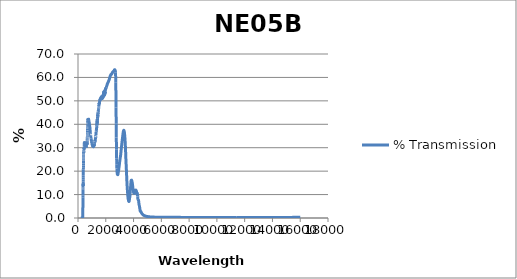
| Category | % Transmission |
|---|---|
| 200.0 | 0.035 |
| 201.0 | 0.035 |
| 202.0 | 0.035 |
| 203.0 | 0.035 |
| 204.0 | 0.034 |
| 205.0 | 0.034 |
| 206.0 | 0.033 |
| 207.0 | 0.033 |
| 208.0 | 0.033 |
| 209.0 | 0.032 |
| 210.0 | 0.032 |
| 211.0 | 0.032 |
| 212.0 | 0.032 |
| 213.0 | 0.031 |
| 214.0 | 0.031 |
| 215.0 | 0.031 |
| 216.0 | 0.03 |
| 217.0 | 0.03 |
| 218.0 | 0.03 |
| 219.0 | 0.03 |
| 220.0 | 0.03 |
| 221.0 | 0.029 |
| 222.0 | 0.029 |
| 223.0 | 0.029 |
| 224.0 | 0.029 |
| 225.0 | 0.028 |
| 226.0 | 0.028 |
| 227.0 | 0.028 |
| 228.0 | 0.028 |
| 229.0 | 0.027 |
| 230.0 | 0.027 |
| 231.0 | 0.027 |
| 232.0 | 0.027 |
| 233.0 | 0.027 |
| 234.0 | 0.027 |
| 235.0 | 0.027 |
| 236.0 | 0.026 |
| 237.0 | 0.026 |
| 238.0 | 0.026 |
| 239.0 | 0.026 |
| 240.0 | 0.026 |
| 241.0 | 0.026 |
| 242.0 | 0.026 |
| 243.0 | 0.025 |
| 244.0 | 0.025 |
| 245.0 | 0.025 |
| 246.0 | 0.025 |
| 247.0 | 0.025 |
| 248.0 | 0.025 |
| 249.0 | 0.025 |
| 250.0 | 0.024 |
| 251.0 | 0.024 |
| 252.0 | 0.024 |
| 253.0 | 0.024 |
| 254.0 | 0.024 |
| 255.0 | 0.024 |
| 256.0 | 0.024 |
| 257.0 | 0.024 |
| 258.0 | 0.023 |
| 259.0 | 0.023 |
| 260.0 | 0.023 |
| 261.0 | 0.023 |
| 262.0 | 0.023 |
| 263.0 | 0.023 |
| 264.0 | 0.023 |
| 265.0 | 0.023 |
| 266.0 | 0.023 |
| 267.0 | 0.023 |
| 268.0 | 0.022 |
| 269.0 | 0.022 |
| 270.0 | 0.022 |
| 271.0 | 0.022 |
| 272.0 | 0.022 |
| 273.0 | 0.022 |
| 274.0 | 0.022 |
| 275.0 | 0.022 |
| 276.0 | 0.022 |
| 277.0 | 0.021 |
| 278.0 | 0.021 |
| 279.0 | 0.021 |
| 280.0 | 0.021 |
| 281.0 | 0.021 |
| 282.0 | 0.021 |
| 283.0 | 0.021 |
| 284.0 | 0.021 |
| 285.0 | 0.021 |
| 286.0 | 0.021 |
| 287.0 | 0.021 |
| 288.0 | 0.02 |
| 289.0 | 0.02 |
| 290.0 | 0.02 |
| 291.0 | 0.02 |
| 292.0 | 0.02 |
| 293.0 | 0.02 |
| 294.0 | 0.02 |
| 295.0 | 0.02 |
| 296.0 | 0.02 |
| 297.0 | 0.02 |
| 298.0 | 0.02 |
| 299.0 | 0.02 |
| 300.0 | 0.02 |
| 301.0 | 0.02 |
| 302.0 | 0.02 |
| 303.0 | 0.02 |
| 304.0 | 0.019 |
| 305.0 | 0.019 |
| 306.0 | 0.019 |
| 307.0 | 0.019 |
| 308.0 | 0.019 |
| 309.0 | 0.019 |
| 310.0 | 0.019 |
| 311.0 | 0.019 |
| 312.0 | 0.019 |
| 313.0 | 0.019 |
| 314.0 | 0.019 |
| 315.0 | 0.019 |
| 316.0 | 0.019 |
| 317.0 | 0.019 |
| 318.0 | 0.019 |
| 319.0 | 0.016 |
| 320.0 | 0.016 |
| 321.0 | 0.016 |
| 322.0 | 0.017 |
| 323.0 | 0.017 |
| 324.0 | 0.017 |
| 325.0 | 0.018 |
| 326.0 | 0.02 |
| 327.0 | 0.023 |
| 328.0 | 0.028 |
| 329.0 | 0.035 |
| 330.0 | 0.046 |
| 331.0 | 0.062 |
| 332.0 | 0.084 |
| 333.0 | 0.113 |
| 334.0 | 0.153 |
| 335.0 | 0.202 |
| 336.0 | 0.266 |
| 337.0 | 0.35 |
| 338.0 | 0.453 |
| 339.0 | 0.581 |
| 340.0 | 0.731 |
| 341.0 | 0.902 |
| 342.0 | 1.106 |
| 343.0 | 1.327 |
| 344.0 | 1.585 |
| 345.0 | 1.873 |
| 346.0 | 2.196 |
| 347.0 | 2.533 |
| 348.0 | 2.92 |
| 349.0 | 3.341 |
| 350.0 | 3.802 |
| 351.0 | 4.289 |
| 352.0 | 4.795 |
| 353.0 | 5.276 |
| 354.0 | 5.813 |
| 355.0 | 6.373 |
| 356.0 | 6.977 |
| 357.0 | 7.609 |
| 358.0 | 8.24 |
| 359.0 | 8.819 |
| 360.0 | 9.467 |
| 361.0 | 10.086 |
| 362.0 | 10.761 |
| 363.0 | 11.398 |
| 364.0 | 12.011 |
| 365.0 | 12.537 |
| 366.0 | 13.116 |
| 367.0 | 13.609 |
| 368.0 | 14.069 |
| 369.0 | 14.492 |
| 370.0 | 14.73 |
| 371.0 | 14.758 |
| 372.0 | 14.711 |
| 373.0 | 14.512 |
| 374.0 | 14.277 |
| 375.0 | 14.029 |
| 376.0 | 13.837 |
| 377.0 | 13.69 |
| 378.0 | 13.903 |
| 379.0 | 14.286 |
| 380.0 | 14.854 |
| 381.0 | 15.499 |
| 382.0 | 16.312 |
| 383.0 | 17.19 |
| 384.0 | 18.195 |
| 385.0 | 19.168 |
| 386.0 | 20.051 |
| 387.0 | 20.815 |
| 388.0 | 21.686 |
| 389.0 | 22.414 |
| 390.0 | 23.208 |
| 391.0 | 23.932 |
| 392.0 | 24.541 |
| 393.0 | 24.892 |
| 394.0 | 25.418 |
| 395.0 | 25.853 |
| 396.0 | 26.366 |
| 397.0 | 26.783 |
| 398.0 | 27.117 |
| 399.0 | 27.202 |
| 400.0 | 27.426 |
| 401.0 | 27.615 |
| 402.0 | 27.845 |
| 403.0 | 28.004 |
| 404.0 | 28.106 |
| 405.0 | 27.989 |
| 406.0 | 28.012 |
| 407.0 | 28.044 |
| 408.0 | 28.161 |
| 409.0 | 28.178 |
| 410.0 | 28.118 |
| 411.0 | 27.95 |
| 412.0 | 28.001 |
| 413.0 | 28.046 |
| 414.0 | 28.137 |
| 415.0 | 28.281 |
| 416.0 | 28.318 |
| 417.0 | 28.248 |
| 418.0 | 28.348 |
| 419.0 | 28.508 |
| 420.0 | 28.703 |
| 421.0 | 28.918 |
| 422.0 | 28.997 |
| 423.0 | 28.987 |
| 424.0 | 29.126 |
| 425.0 | 29.282 |
| 426.0 | 29.455 |
| 427.0 | 29.655 |
| 428.0 | 29.713 |
| 429.0 | 29.66 |
| 430.0 | 29.684 |
| 431.0 | 29.762 |
| 432.0 | 29.844 |
| 433.0 | 29.91 |
| 434.0 | 29.847 |
| 435.0 | 29.711 |
| 436.0 | 29.644 |
| 437.0 | 29.638 |
| 438.0 | 29.68 |
| 439.0 | 29.753 |
| 440.0 | 29.742 |
| 441.0 | 29.648 |
| 442.0 | 29.676 |
| 443.0 | 29.807 |
| 444.0 | 29.972 |
| 445.0 | 30.196 |
| 446.0 | 30.318 |
| 447.0 | 30.366 |
| 448.0 | 30.548 |
| 449.0 | 30.73 |
| 450.0 | 31.002 |
| 451.0 | 31.359 |
| 452.0 | 31.472 |
| 453.0 | 31.463 |
| 454.0 | 31.622 |
| 455.0 | 31.76 |
| 456.0 | 31.973 |
| 457.0 | 32.228 |
| 458.0 | 32.287 |
| 459.0 | 32.22 |
| 460.0 | 32.25 |
| 461.0 | 32.319 |
| 462.0 | 32.437 |
| 463.0 | 32.556 |
| 464.0 | 32.519 |
| 465.0 | 32.375 |
| 466.0 | 32.37 |
| 467.0 | 32.347 |
| 468.0 | 32.4 |
| 469.0 | 32.46 |
| 470.0 | 32.348 |
| 471.0 | 32.16 |
| 472.0 | 32.115 |
| 473.0 | 32.09 |
| 474.0 | 32.132 |
| 475.0 | 32.171 |
| 476.0 | 32.017 |
| 477.0 | 31.8 |
| 478.0 | 31.728 |
| 479.0 | 31.673 |
| 480.0 | 31.71 |
| 481.0 | 31.753 |
| 482.0 | 31.618 |
| 483.0 | 31.418 |
| 484.0 | 31.339 |
| 485.0 | 31.266 |
| 486.0 | 31.307 |
| 487.0 | 31.357 |
| 488.0 | 31.219 |
| 489.0 | 31.045 |
| 490.0 | 31.004 |
| 491.0 | 30.967 |
| 492.0 | 31.006 |
| 493.0 | 31.064 |
| 494.0 | 30.948 |
| 495.0 | 30.81 |
| 496.0 | 30.776 |
| 497.0 | 30.767 |
| 498.0 | 30.829 |
| 499.0 | 30.844 |
| 500.0 | 30.731 |
| 501.0 | 30.614 |
| 502.0 | 30.609 |
| 503.0 | 30.639 |
| 504.0 | 30.704 |
| 505.0 | 30.775 |
| 506.0 | 30.684 |
| 507.0 | 30.585 |
| 508.0 | 30.576 |
| 509.0 | 30.591 |
| 510.0 | 30.686 |
| 511.0 | 30.771 |
| 512.0 | 30.699 |
| 513.0 | 30.63 |
| 514.0 | 30.668 |
| 515.0 | 30.715 |
| 516.0 | 30.83 |
| 517.0 | 30.96 |
| 518.0 | 30.922 |
| 519.0 | 30.864 |
| 520.0 | 30.894 |
| 521.0 | 30.976 |
| 522.0 | 31.122 |
| 523.0 | 31.241 |
| 524.0 | 31.213 |
| 525.0 | 31.191 |
| 526.0 | 31.229 |
| 527.0 | 31.312 |
| 528.0 | 31.501 |
| 529.0 | 31.633 |
| 530.0 | 31.578 |
| 531.0 | 31.562 |
| 532.0 | 31.634 |
| 533.0 | 31.727 |
| 534.0 | 31.901 |
| 535.0 | 32.012 |
| 536.0 | 31.978 |
| 537.0 | 31.973 |
| 538.0 | 32.049 |
| 539.0 | 32.119 |
| 540.0 | 32.285 |
| 541.0 | 32.362 |
| 542.0 | 32.261 |
| 543.0 | 32.226 |
| 544.0 | 32.263 |
| 545.0 | 32.396 |
| 546.0 | 32.484 |
| 547.0 | 32.547 |
| 548.0 | 32.426 |
| 549.0 | 32.338 |
| 550.0 | 32.343 |
| 551.0 | 32.413 |
| 552.0 | 32.454 |
| 553.0 | 32.37 |
| 554.0 | 32.308 |
| 555.0 | 32.227 |
| 556.0 | 32.153 |
| 557.0 | 32.207 |
| 558.0 | 32.269 |
| 559.0 | 32.292 |
| 560.0 | 32.098 |
| 561.0 | 32.083 |
| 562.0 | 31.977 |
| 563.0 | 31.839 |
| 564.0 | 31.775 |
| 565.0 | 31.783 |
| 566.0 | 31.823 |
| 567.0 | 31.672 |
| 568.0 | 31.511 |
| 569.0 | 31.384 |
| 570.0 | 31.309 |
| 571.0 | 31.323 |
| 572.0 | 31.35 |
| 573.0 | 31.194 |
| 574.0 | 31.062 |
| 575.0 | 30.953 |
| 576.0 | 30.854 |
| 577.0 | 30.848 |
| 578.0 | 30.88 |
| 579.0 | 30.729 |
| 580.0 | 30.546 |
| 581.0 | 30.462 |
| 582.0 | 30.396 |
| 583.0 | 30.448 |
| 584.0 | 30.507 |
| 585.0 | 30.365 |
| 586.0 | 30.271 |
| 587.0 | 30.218 |
| 588.0 | 30.151 |
| 589.0 | 30.234 |
| 590.0 | 30.306 |
| 591.0 | 30.23 |
| 592.0 | 30.173 |
| 593.0 | 30.183 |
| 594.0 | 30.143 |
| 595.0 | 30.293 |
| 596.0 | 30.372 |
| 597.0 | 30.318 |
| 598.0 | 30.278 |
| 599.0 | 30.369 |
| 600.0 | 30.395 |
| 601.0 | 30.495 |
| 602.0 | 30.595 |
| 603.0 | 30.591 |
| 604.0 | 30.533 |
| 605.0 | 30.631 |
| 606.0 | 30.655 |
| 607.0 | 30.778 |
| 608.0 | 30.903 |
| 609.0 | 30.929 |
| 610.0 | 30.87 |
| 611.0 | 30.96 |
| 612.0 | 30.944 |
| 613.0 | 31.092 |
| 614.0 | 31.225 |
| 615.0 | 31.175 |
| 616.0 | 31.167 |
| 617.0 | 31.231 |
| 618.0 | 31.282 |
| 619.0 | 31.405 |
| 620.0 | 31.52 |
| 621.0 | 31.422 |
| 622.0 | 31.437 |
| 623.0 | 31.506 |
| 624.0 | 31.42 |
| 625.0 | 31.605 |
| 626.0 | 31.755 |
| 627.0 | 31.553 |
| 628.0 | 31.549 |
| 629.0 | 31.606 |
| 630.0 | 31.58 |
| 631.0 | 31.678 |
| 632.0 | 31.754 |
| 633.0 | 31.58 |
| 634.0 | 31.561 |
| 635.0 | 31.59 |
| 636.0 | 31.558 |
| 637.0 | 31.621 |
| 638.0 | 31.754 |
| 639.0 | 31.561 |
| 640.0 | 31.52 |
| 641.0 | 31.523 |
| 642.0 | 31.546 |
| 643.0 | 31.62 |
| 644.0 | 31.693 |
| 645.0 | 31.542 |
| 646.0 | 31.572 |
| 647.0 | 31.609 |
| 648.0 | 31.643 |
| 649.0 | 31.718 |
| 650.0 | 31.841 |
| 651.0 | 31.728 |
| 652.0 | 31.753 |
| 653.0 | 31.775 |
| 654.0 | 31.848 |
| 655.0 | 32.056 |
| 656.0 | 32.217 |
| 657.0 | 32.027 |
| 658.0 | 32.067 |
| 659.0 | 32.189 |
| 660.0 | 32.264 |
| 661.0 | 32.502 |
| 662.0 | 32.645 |
| 663.0 | 32.558 |
| 664.0 | 32.659 |
| 665.0 | 32.892 |
| 666.0 | 33.008 |
| 667.0 | 33.223 |
| 668.0 | 33.558 |
| 669.0 | 33.496 |
| 670.0 | 33.61 |
| 671.0 | 33.83 |
| 672.0 | 34.106 |
| 673.0 | 34.367 |
| 674.0 | 34.514 |
| 675.0 | 34.582 |
| 676.0 | 34.734 |
| 677.0 | 35.054 |
| 678.0 | 35.229 |
| 679.0 | 35.678 |
| 680.0 | 35.923 |
| 681.0 | 35.961 |
| 682.0 | 36.218 |
| 683.0 | 36.541 |
| 684.0 | 36.701 |
| 685.0 | 37.127 |
| 686.0 | 37.392 |
| 687.0 | 37.416 |
| 688.0 | 37.585 |
| 689.0 | 38.057 |
| 690.0 | 38.226 |
| 691.0 | 38.4 |
| 692.0 | 38.582 |
| 693.0 | 38.904 |
| 694.0 | 38.917 |
| 695.0 | 39.269 |
| 696.0 | 39.225 |
| 697.0 | 39.642 |
| 698.0 | 39.916 |
| 699.0 | 39.852 |
| 700.0 | 39.898 |
| 701.0 | 40.243 |
| 702.0 | 40.287 |
| 703.0 | 40.599 |
| 704.0 | 40.752 |
| 705.0 | 40.749 |
| 706.0 | 40.767 |
| 707.0 | 40.952 |
| 708.0 | 40.865 |
| 709.0 | 41.267 |
| 710.0 | 41.43 |
| 711.0 | 41.217 |
| 712.0 | 41.328 |
| 713.0 | 41.531 |
| 714.0 | 41.475 |
| 715.0 | 41.781 |
| 716.0 | 41.789 |
| 717.0 | 41.698 |
| 718.0 | 41.762 |
| 719.0 | 41.875 |
| 720.0 | 41.82 |
| 721.0 | 42.055 |
| 722.0 | 42.062 |
| 723.0 | 41.972 |
| 724.0 | 41.995 |
| 725.0 | 42.08 |
| 726.0 | 42.017 |
| 727.0 | 42.175 |
| 728.0 | 42.222 |
| 729.0 | 42.083 |
| 730.0 | 42.164 |
| 731.0 | 42.21 |
| 732.0 | 42.1 |
| 733.0 | 42.237 |
| 734.0 | 42.351 |
| 735.0 | 42.118 |
| 736.0 | 42.145 |
| 737.0 | 42.185 |
| 738.0 | 42.231 |
| 739.0 | 42.324 |
| 740.0 | 42.398 |
| 741.0 | 42.109 |
| 742.0 | 42.165 |
| 743.0 | 42.168 |
| 744.0 | 42.173 |
| 745.0 | 42.189 |
| 746.0 | 42.375 |
| 747.0 | 42.108 |
| 748.0 | 42.088 |
| 749.0 | 42.051 |
| 750.0 | 42.179 |
| 751.0 | 42.176 |
| 752.0 | 42.18 |
| 753.0 | 42.183 |
| 754.0 | 42.175 |
| 755.0 | 42.169 |
| 756.0 | 42.159 |
| 757.0 | 42.148 |
| 758.0 | 42.144 |
| 759.0 | 42.139 |
| 760.0 | 42.118 |
| 761.0 | 42.106 |
| 762.0 | 42.092 |
| 763.0 | 42.076 |
| 764.0 | 42.061 |
| 765.0 | 42.044 |
| 766.0 | 42.015 |
| 767.0 | 41.993 |
| 768.0 | 41.969 |
| 769.0 | 41.944 |
| 770.0 | 41.922 |
| 771.0 | 41.903 |
| 772.0 | 41.867 |
| 773.0 | 41.842 |
| 774.0 | 41.817 |
| 775.0 | 41.787 |
| 776.0 | 41.767 |
| 777.0 | 41.741 |
| 778.0 | 41.702 |
| 779.0 | 41.671 |
| 780.0 | 41.641 |
| 781.0 | 41.61 |
| 782.0 | 41.584 |
| 783.0 | 41.554 |
| 784.0 | 41.511 |
| 785.0 | 41.475 |
| 786.0 | 41.44 |
| 787.0 | 41.406 |
| 788.0 | 41.377 |
| 789.0 | 41.344 |
| 790.0 | 41.3 |
| 791.0 | 41.262 |
| 792.0 | 41.231 |
| 793.0 | 41.197 |
| 794.0 | 41.17 |
| 795.0 | 41.136 |
| 796.0 | 41.092 |
| 797.0 | 41.052 |
| 798.0 | 41.011 |
| 799.0 | 40.974 |
| 800.0 | 40.947 |
| 801.0 | 40.909 |
| 802.0 | 40.867 |
| 803.0 | 40.83 |
| 804.0 | 40.79 |
| 805.0 | 40.749 |
| 806.0 | 40.716 |
| 807.0 | 40.676 |
| 808.0 | 40.633 |
| 809.0 | 40.595 |
| 810.0 | 40.564 |
| 811.0 | 40.522 |
| 812.0 | 40.478 |
| 813.0 | 40.428 |
| 814.0 | 40.38 |
| 815.0 | 40.346 |
| 816.0 | 40.314 |
| 817.0 | 40.269 |
| 818.0 | 40.223 |
| 819.0 | 40.173 |
| 820.0 | 40.125 |
| 821.0 | 40.087 |
| 822.0 | 40.054 |
| 823.0 | 40.011 |
| 824.0 | 39.962 |
| 825.0 | 39.91 |
| 826.0 | 39.863 |
| 827.0 | 39.822 |
| 828.0 | 39.782 |
| 829.0 | 39.737 |
| 830.0 | 39.696 |
| 831.0 | 39.648 |
| 832.0 | 39.602 |
| 833.0 | 39.566 |
| 834.0 | 39.53 |
| 835.0 | 39.481 |
| 836.0 | 39.44 |
| 837.0 | 39.403 |
| 838.0 | 39.368 |
| 839.0 | 39.332 |
| 840.0 | 39.29 |
| 841.0 | 39.237 |
| 842.0 | 39.196 |
| 843.0 | 39.159 |
| 844.0 | 39.116 |
| 845.0 | 39.075 |
| 846.0 | 39.039 |
| 847.0 | 38.997 |
| 848.0 | 38.957 |
| 849.0 | 38.917 |
| 850.0 | 38.876 |
| 851.0 | 38.835 |
| 852.0 | 38.791 |
| 853.0 | 38.746 |
| 854.0 | 38.703 |
| 855.0 | 38.657 |
| 856.0 | 38.618 |
| 857.0 | 38.576 |
| 858.0 | 38.528 |
| 859.0 | 38.481 |
| 860.0 | 38.439 |
| 861.0 | 38.388 |
| 862.0 | 38.324 |
| 863.0 | 38.272 |
| 864.0 | 38.215 |
| 865.0 | 38.147 |
| 866.0 | 38.053 |
| 867.0 | 37.932 |
| 868.0 | 37.827 |
| 869.0 | 37.759 |
| 870.0 | 37.716 |
| 871.0 | 37.665 |
| 872.0 | 37.566 |
| 873.0 | 37.434 |
| 874.0 | 37.308 |
| 875.0 | 37.217 |
| 876.0 | 37.176 |
| 877.0 | 37.139 |
| 878.0 | 37.078 |
| 879.0 | 37.009 |
| 880.0 | 36.936 |
| 881.0 | 36.808 |
| 882.0 | 36.666 |
| 883.0 | 36.567 |
| 884.0 | 36.482 |
| 885.0 | 36.384 |
| 886.0 | 36.308 |
| 887.0 | 36.263 |
| 888.0 | 36.207 |
| 889.0 | 36.132 |
| 890.0 | 36.058 |
| 891.0 | 36.02 |
| 892.0 | 35.996 |
| 893.0 | 35.959 |
| 894.0 | 35.909 |
| 895.0 | 35.845 |
| 896.0 | 35.775 |
| 897.0 | 35.757 |
| 898.0 | 35.776 |
| 899.0 | 35.778 |
| 900.0 | 35.724 |
| 901.0 | 35.62 |
| 902.0 | 35.53 |
| 903.0 | 35.471 |
| 904.0 | 35.399 |
| 905.0 | 35.324 |
| 906.0 | 35.315 |
| 907.0 | 35.316 |
| 908.0 | 35.245 |
| 909.0 | 35.18 |
| 910.0 | 35.196 |
| 911.0 | 35.22 |
| 912.0 | 35.17 |
| 913.0 | 35.058 |
| 914.0 | 34.971 |
| 915.0 | 34.94 |
| 916.0 | 34.936 |
| 917.0 | 34.928 |
| 918.0 | 34.909 |
| 919.0 | 34.869 |
| 920.0 | 34.77 |
| 921.0 | 34.662 |
| 922.0 | 34.582 |
| 923.0 | 34.533 |
| 924.0 | 34.507 |
| 925.0 | 34.491 |
| 926.0 | 34.442 |
| 927.0 | 34.381 |
| 928.0 | 34.353 |
| 929.0 | 34.338 |
| 930.0 | 34.301 |
| 931.0 | 34.266 |
| 932.0 | 34.263 |
| 933.0 | 34.269 |
| 934.0 | 34.235 |
| 935.0 | 34.145 |
| 936.0 | 34.011 |
| 937.0 | 33.941 |
| 938.0 | 33.976 |
| 939.0 | 33.986 |
| 940.0 | 33.898 |
| 941.0 | 33.794 |
| 942.0 | 33.753 |
| 943.0 | 33.723 |
| 944.0 | 33.653 |
| 945.0 | 33.627 |
| 946.0 | 33.623 |
| 947.0 | 33.623 |
| 948.0 | 33.622 |
| 949.0 | 33.59 |
| 950.0 | 33.518 |
| 951.0 | 33.455 |
| 952.0 | 33.413 |
| 953.0 | 33.373 |
| 954.0 | 33.341 |
| 955.0 | 33.312 |
| 956.0 | 33.256 |
| 957.0 | 33.168 |
| 958.0 | 33.132 |
| 959.0 | 33.119 |
| 960.0 | 33.087 |
| 961.0 | 33.085 |
| 962.0 | 33.06 |
| 963.0 | 33.006 |
| 964.0 | 32.959 |
| 965.0 | 32.962 |
| 966.0 | 32.983 |
| 967.0 | 32.94 |
| 968.0 | 32.873 |
| 969.0 | 32.872 |
| 970.0 | 32.859 |
| 971.0 | 32.816 |
| 972.0 | 32.732 |
| 973.0 | 32.655 |
| 974.0 | 32.589 |
| 975.0 | 32.607 |
| 976.0 | 32.645 |
| 977.0 | 32.637 |
| 978.0 | 32.561 |
| 979.0 | 32.479 |
| 980.0 | 32.456 |
| 981.0 | 32.439 |
| 982.0 | 32.448 |
| 983.0 | 32.413 |
| 984.0 | 32.37 |
| 985.0 | 32.34 |
| 986.0 | 32.32 |
| 987.0 | 32.305 |
| 988.0 | 32.248 |
| 989.0 | 32.208 |
| 990.0 | 32.2 |
| 991.0 | 32.145 |
| 992.0 | 32.102 |
| 993.0 | 32.124 |
| 994.0 | 32.12 |
| 995.0 | 32.088 |
| 996.0 | 32.049 |
| 997.0 | 32.019 |
| 998.0 | 32.011 |
| 999.0 | 32.014 |
| 1000.0 | 31.952 |
| 1001.0 | 31.877 |
| 1002.0 | 31.857 |
| 1003.0 | 31.87 |
| 1004.0 | 31.884 |
| 1005.0 | 31.858 |
| 1006.0 | 31.812 |
| 1007.0 | 31.786 |
| 1008.0 | 31.781 |
| 1009.0 | 31.77 |
| 1010.0 | 31.737 |
| 1011.0 | 31.689 |
| 1012.0 | 31.681 |
| 1013.0 | 31.709 |
| 1014.0 | 31.714 |
| 1015.0 | 31.679 |
| 1016.0 | 31.64 |
| 1017.0 | 31.619 |
| 1018.0 | 31.569 |
| 1019.0 | 31.518 |
| 1020.0 | 31.5 |
| 1021.0 | 31.506 |
| 1022.0 | 31.505 |
| 1023.0 | 31.427 |
| 1024.0 | 31.403 |
| 1025.0 | 31.396 |
| 1026.0 | 31.384 |
| 1027.0 | 31.329 |
| 1028.0 | 31.273 |
| 1029.0 | 31.278 |
| 1030.0 | 31.305 |
| 1031.0 | 31.335 |
| 1032.0 | 31.283 |
| 1033.0 | 31.213 |
| 1034.0 | 31.162 |
| 1035.0 | 31.181 |
| 1036.0 | 31.209 |
| 1037.0 | 31.195 |
| 1038.0 | 31.145 |
| 1039.0 | 31.088 |
| 1040.0 | 31.02 |
| 1041.0 | 30.992 |
| 1042.0 | 31.011 |
| 1043.0 | 31.009 |
| 1044.0 | 31.004 |
| 1045.0 | 30.995 |
| 1046.0 | 30.97 |
| 1047.0 | 30.938 |
| 1048.0 | 30.987 |
| 1049.0 | 30.981 |
| 1050.0 | 30.978 |
| 1051.0 | 30.99 |
| 1052.0 | 30.993 |
| 1053.0 | 30.98 |
| 1054.0 | 30.891 |
| 1055.0 | 30.786 |
| 1056.0 | 30.767 |
| 1057.0 | 30.787 |
| 1058.0 | 30.805 |
| 1059.0 | 30.819 |
| 1060.0 | 30.77 |
| 1061.0 | 30.715 |
| 1062.0 | 30.698 |
| 1063.0 | 30.704 |
| 1064.0 | 30.73 |
| 1065.0 | 30.773 |
| 1066.0 | 30.786 |
| 1067.0 | 30.747 |
| 1068.0 | 30.705 |
| 1069.0 | 30.67 |
| 1070.0 | 30.614 |
| 1071.0 | 30.607 |
| 1072.0 | 30.677 |
| 1073.0 | 30.676 |
| 1074.0 | 30.643 |
| 1075.0 | 30.618 |
| 1076.0 | 30.589 |
| 1077.0 | 30.563 |
| 1078.0 | 30.562 |
| 1079.0 | 30.658 |
| 1080.0 | 30.77 |
| 1081.0 | 30.764 |
| 1082.0 | 30.726 |
| 1083.0 | 30.703 |
| 1084.0 | 30.661 |
| 1085.0 | 30.644 |
| 1086.0 | 30.684 |
| 1087.0 | 30.697 |
| 1088.0 | 30.702 |
| 1089.0 | 30.713 |
| 1090.0 | 30.697 |
| 1091.0 | 30.673 |
| 1092.0 | 30.638 |
| 1093.0 | 30.613 |
| 1094.0 | 30.652 |
| 1095.0 | 30.72 |
| 1096.0 | 30.755 |
| 1097.0 | 30.726 |
| 1098.0 | 30.672 |
| 1099.0 | 30.634 |
| 1100.0 | 30.588 |
| 1101.0 | 30.575 |
| 1102.0 | 30.628 |
| 1103.0 | 30.671 |
| 1104.0 | 30.658 |
| 1105.0 | 30.618 |
| 1106.0 | 30.611 |
| 1107.0 | 30.611 |
| 1108.0 | 30.599 |
| 1109.0 | 30.596 |
| 1110.0 | 30.562 |
| 1111.0 | 30.484 |
| 1112.0 | 30.47 |
| 1113.0 | 30.46 |
| 1114.0 | 30.446 |
| 1115.0 | 30.472 |
| 1116.0 | 30.521 |
| 1117.0 | 30.566 |
| 1118.0 | 30.608 |
| 1119.0 | 30.591 |
| 1120.0 | 30.579 |
| 1121.0 | 30.606 |
| 1122.0 | 30.625 |
| 1123.0 | 30.653 |
| 1124.0 | 30.679 |
| 1125.0 | 30.712 |
| 1126.0 | 30.742 |
| 1127.0 | 30.78 |
| 1128.0 | 30.815 |
| 1129.0 | 30.839 |
| 1130.0 | 30.843 |
| 1131.0 | 30.803 |
| 1132.0 | 30.721 |
| 1133.0 | 30.69 |
| 1134.0 | 30.711 |
| 1135.0 | 30.844 |
| 1136.0 | 30.945 |
| 1137.0 | 30.959 |
| 1138.0 | 30.967 |
| 1139.0 | 30.962 |
| 1140.0 | 30.952 |
| 1141.0 | 30.924 |
| 1142.0 | 30.889 |
| 1143.0 | 30.854 |
| 1144.0 | 30.81 |
| 1145.0 | 30.764 |
| 1146.0 | 30.718 |
| 1147.0 | 30.752 |
| 1148.0 | 30.801 |
| 1149.0 | 30.882 |
| 1150.0 | 30.963 |
| 1151.0 | 31.007 |
| 1152.0 | 30.971 |
| 1153.0 | 30.936 |
| 1154.0 | 30.889 |
| 1155.0 | 30.866 |
| 1156.0 | 30.892 |
| 1157.0 | 30.972 |
| 1158.0 | 31.016 |
| 1159.0 | 31.041 |
| 1160.0 | 31.014 |
| 1161.0 | 30.998 |
| 1162.0 | 31.013 |
| 1163.0 | 31.036 |
| 1164.0 | 31.075 |
| 1165.0 | 31.112 |
| 1166.0 | 31.165 |
| 1167.0 | 31.238 |
| 1168.0 | 31.314 |
| 1169.0 | 31.392 |
| 1170.0 | 31.473 |
| 1171.0 | 31.525 |
| 1172.0 | 31.495 |
| 1173.0 | 31.447 |
| 1174.0 | 31.375 |
| 1175.0 | 31.305 |
| 1176.0 | 31.249 |
| 1177.0 | 31.242 |
| 1178.0 | 31.291 |
| 1179.0 | 31.36 |
| 1180.0 | 31.437 |
| 1181.0 | 31.54 |
| 1182.0 | 31.663 |
| 1183.0 | 31.788 |
| 1184.0 | 31.883 |
| 1185.0 | 31.921 |
| 1186.0 | 31.964 |
| 1187.0 | 32.005 |
| 1188.0 | 32.078 |
| 1189.0 | 32.193 |
| 1190.0 | 32.276 |
| 1191.0 | 32.279 |
| 1192.0 | 32.276 |
| 1193.0 | 32.278 |
| 1194.0 | 32.276 |
| 1195.0 | 32.263 |
| 1196.0 | 32.254 |
| 1197.0 | 32.268 |
| 1198.0 | 32.343 |
| 1199.0 | 32.427 |
| 1200.0 | 32.506 |
| 1201.0 | 32.596 |
| 1202.0 | 32.67 |
| 1203.0 | 32.691 |
| 1204.0 | 32.718 |
| 1205.0 | 32.764 |
| 1206.0 | 32.794 |
| 1207.0 | 32.808 |
| 1208.0 | 32.818 |
| 1209.0 | 32.815 |
| 1210.0 | 32.807 |
| 1211.0 | 32.793 |
| 1212.0 | 32.766 |
| 1213.0 | 32.704 |
| 1214.0 | 32.613 |
| 1215.0 | 32.564 |
| 1216.0 | 32.594 |
| 1217.0 | 32.635 |
| 1218.0 | 32.688 |
| 1219.0 | 32.769 |
| 1220.0 | 32.831 |
| 1221.0 | 32.865 |
| 1222.0 | 32.9 |
| 1223.0 | 32.931 |
| 1224.0 | 32.969 |
| 1225.0 | 32.991 |
| 1226.0 | 32.974 |
| 1227.0 | 32.936 |
| 1228.0 | 32.907 |
| 1229.0 | 32.875 |
| 1230.0 | 32.827 |
| 1231.0 | 32.773 |
| 1232.0 | 32.725 |
| 1233.0 | 32.676 |
| 1234.0 | 32.682 |
| 1235.0 | 32.747 |
| 1236.0 | 32.822 |
| 1237.0 | 32.912 |
| 1238.0 | 33.001 |
| 1239.0 | 33.089 |
| 1240.0 | 33.182 |
| 1241.0 | 33.275 |
| 1242.0 | 33.362 |
| 1243.0 | 33.431 |
| 1244.0 | 33.461 |
| 1245.0 | 33.504 |
| 1246.0 | 33.569 |
| 1247.0 | 33.61 |
| 1248.0 | 33.625 |
| 1249.0 | 33.638 |
| 1250.0 | 33.685 |
| 1251.0 | 33.774 |
| 1252.0 | 33.859 |
| 1253.0 | 33.906 |
| 1254.0 | 33.922 |
| 1255.0 | 33.937 |
| 1256.0 | 33.974 |
| 1257.0 | 34.045 |
| 1258.0 | 34.148 |
| 1259.0 | 34.24 |
| 1260.0 | 34.326 |
| 1261.0 | 34.414 |
| 1262.0 | 34.433 |
| 1263.0 | 34.387 |
| 1264.0 | 34.322 |
| 1265.0 | 34.274 |
| 1266.0 | 34.254 |
| 1267.0 | 34.234 |
| 1268.0 | 34.216 |
| 1269.0 | 34.22 |
| 1270.0 | 34.245 |
| 1271.0 | 34.296 |
| 1272.0 | 34.374 |
| 1273.0 | 34.458 |
| 1274.0 | 34.544 |
| 1275.0 | 34.61 |
| 1276.0 | 34.662 |
| 1277.0 | 34.72 |
| 1278.0 | 34.811 |
| 1279.0 | 34.929 |
| 1280.0 | 35.043 |
| 1281.0 | 35.129 |
| 1282.0 | 35.168 |
| 1283.0 | 35.207 |
| 1284.0 | 35.253 |
| 1285.0 | 35.274 |
| 1286.0 | 35.297 |
| 1287.0 | 35.389 |
| 1288.0 | 35.543 |
| 1289.0 | 35.686 |
| 1290.0 | 35.79 |
| 1291.0 | 35.866 |
| 1292.0 | 35.94 |
| 1293.0 | 36.014 |
| 1294.0 | 36.087 |
| 1295.0 | 36.165 |
| 1296.0 | 36.234 |
| 1297.0 | 36.29 |
| 1298.0 | 36.35 |
| 1299.0 | 36.421 |
| 1300.0 | 36.489 |
| 1301.0 | 36.514 |
| 1302.0 | 36.519 |
| 1303.0 | 36.528 |
| 1304.0 | 36.552 |
| 1305.0 | 36.613 |
| 1306.0 | 36.727 |
| 1307.0 | 36.875 |
| 1308.0 | 36.983 |
| 1309.0 | 37.014 |
| 1310.0 | 37.024 |
| 1311.0 | 37.024 |
| 1312.0 | 37.026 |
| 1313.0 | 37.054 |
| 1314.0 | 37.111 |
| 1315.0 | 37.196 |
| 1316.0 | 37.298 |
| 1317.0 | 37.366 |
| 1318.0 | 37.415 |
| 1319.0 | 37.46 |
| 1320.0 | 37.489 |
| 1321.0 | 37.506 |
| 1322.0 | 37.537 |
| 1323.0 | 37.562 |
| 1324.0 | 37.585 |
| 1325.0 | 37.622 |
| 1326.0 | 37.708 |
| 1327.0 | 37.82 |
| 1328.0 | 37.918 |
| 1329.0 | 37.974 |
| 1330.0 | 37.985 |
| 1331.0 | 37.966 |
| 1332.0 | 37.938 |
| 1333.0 | 37.914 |
| 1334.0 | 37.927 |
| 1335.0 | 37.962 |
| 1336.0 | 38.019 |
| 1337.0 | 38.079 |
| 1338.0 | 38.143 |
| 1339.0 | 38.225 |
| 1340.0 | 38.347 |
| 1341.0 | 38.508 |
| 1342.0 | 38.696 |
| 1343.0 | 38.823 |
| 1344.0 | 38.874 |
| 1345.0 | 38.9 |
| 1346.0 | 38.993 |
| 1347.0 | 39.152 |
| 1348.0 | 39.356 |
| 1349.0 | 39.482 |
| 1350.0 | 39.581 |
| 1351.0 | 39.627 |
| 1352.0 | 39.561 |
| 1353.0 | 39.489 |
| 1354.0 | 39.542 |
| 1355.0 | 39.776 |
| 1356.0 | 40.024 |
| 1357.0 | 40.131 |
| 1358.0 | 40.064 |
| 1359.0 | 39.882 |
| 1360.0 | 39.762 |
| 1361.0 | 39.917 |
| 1362.0 | 40.175 |
| 1363.0 | 40.309 |
| 1364.0 | 40.421 |
| 1365.0 | 40.447 |
| 1366.0 | 40.251 |
| 1367.0 | 40.044 |
| 1368.0 | 40.009 |
| 1369.0 | 40.031 |
| 1370.0 | 40.165 |
| 1371.0 | 40.415 |
| 1372.0 | 40.55 |
| 1373.0 | 40.509 |
| 1374.0 | 40.532 |
| 1375.0 | 40.718 |
| 1376.0 | 41.02 |
| 1377.0 | 41.386 |
| 1378.0 | 41.542 |
| 1379.0 | 41.314 |
| 1380.0 | 40.868 |
| 1381.0 | 40.533 |
| 1382.0 | 40.578 |
| 1383.0 | 40.936 |
| 1384.0 | 41.381 |
| 1385.0 | 41.653 |
| 1386.0 | 41.56 |
| 1387.0 | 41.479 |
| 1388.0 | 41.76 |
| 1389.0 | 41.974 |
| 1390.0 | 41.92 |
| 1391.0 | 42 |
| 1392.0 | 42.149 |
| 1393.0 | 42.037 |
| 1394.0 | 41.982 |
| 1395.0 | 42.199 |
| 1396.0 | 42.379 |
| 1397.0 | 42.162 |
| 1398.0 | 41.845 |
| 1399.0 | 41.73 |
| 1400.0 | 41.929 |
| 1401.0 | 42.14 |
| 1402.0 | 42.034 |
| 1403.0 | 41.997 |
| 1404.0 | 42.313 |
| 1405.0 | 42.697 |
| 1406.0 | 42.89 |
| 1407.0 | 42.779 |
| 1408.0 | 42.681 |
| 1409.0 | 42.813 |
| 1410.0 | 42.995 |
| 1411.0 | 43.131 |
| 1412.0 | 43.055 |
| 1413.0 | 42.823 |
| 1414.0 | 42.799 |
| 1415.0 | 43.003 |
| 1416.0 | 43.127 |
| 1417.0 | 43.11 |
| 1418.0 | 43.337 |
| 1419.0 | 43.654 |
| 1420.0 | 43.604 |
| 1421.0 | 43.352 |
| 1422.0 | 43.526 |
| 1423.0 | 43.952 |
| 1424.0 | 44.194 |
| 1425.0 | 43.94 |
| 1426.0 | 43.592 |
| 1427.0 | 43.605 |
| 1428.0 | 43.815 |
| 1429.0 | 43.923 |
| 1430.0 | 44.035 |
| 1431.0 | 44.257 |
| 1432.0 | 44.564 |
| 1433.0 | 44.737 |
| 1434.0 | 44.679 |
| 1435.0 | 44.56 |
| 1436.0 | 44.561 |
| 1437.0 | 44.662 |
| 1438.0 | 44.676 |
| 1439.0 | 44.551 |
| 1440.0 | 44.564 |
| 1441.0 | 44.714 |
| 1442.0 | 44.928 |
| 1443.0 | 44.971 |
| 1444.0 | 44.914 |
| 1445.0 | 44.933 |
| 1446.0 | 45.002 |
| 1447.0 | 45.013 |
| 1448.0 | 44.997 |
| 1449.0 | 45.038 |
| 1450.0 | 45.195 |
| 1451.0 | 45.366 |
| 1452.0 | 45.496 |
| 1453.0 | 45.459 |
| 1454.0 | 45.459 |
| 1455.0 | 45.483 |
| 1456.0 | 45.501 |
| 1457.0 | 45.502 |
| 1458.0 | 45.526 |
| 1459.0 | 45.581 |
| 1460.0 | 45.688 |
| 1461.0 | 45.744 |
| 1462.0 | 45.808 |
| 1463.0 | 45.896 |
| 1464.0 | 46.022 |
| 1465.0 | 45.986 |
| 1466.0 | 45.935 |
| 1467.0 | 45.905 |
| 1468.0 | 45.981 |
| 1469.0 | 46.032 |
| 1470.0 | 46.051 |
| 1471.0 | 46.091 |
| 1472.0 | 46.178 |
| 1473.0 | 46.266 |
| 1474.0 | 46.248 |
| 1475.0 | 46.172 |
| 1476.0 | 46.141 |
| 1477.0 | 46.149 |
| 1478.0 | 46.284 |
| 1479.0 | 46.393 |
| 1480.0 | 46.486 |
| 1481.0 | 46.546 |
| 1482.0 | 46.575 |
| 1483.0 | 46.577 |
| 1484.0 | 46.583 |
| 1485.0 | 46.649 |
| 1486.0 | 46.797 |
| 1487.0 | 46.956 |
| 1488.0 | 47.07 |
| 1489.0 | 47.158 |
| 1490.0 | 47.349 |
| 1491.0 | 47.511 |
| 1492.0 | 47.586 |
| 1493.0 | 47.652 |
| 1494.0 | 47.748 |
| 1495.0 | 47.812 |
| 1496.0 | 47.878 |
| 1497.0 | 47.966 |
| 1498.0 | 48.081 |
| 1499.0 | 48.211 |
| 1500.0 | 48.317 |
| 1501.0 | 48.305 |
| 1502.0 | 48.297 |
| 1503.0 | 48.288 |
| 1504.0 | 48.339 |
| 1505.0 | 48.411 |
| 1506.0 | 48.504 |
| 1507.0 | 48.578 |
| 1508.0 | 48.57 |
| 1509.0 | 48.564 |
| 1510.0 | 48.568 |
| 1511.0 | 48.554 |
| 1512.0 | 48.554 |
| 1513.0 | 48.614 |
| 1514.0 | 48.611 |
| 1515.0 | 48.548 |
| 1516.0 | 48.528 |
| 1517.0 | 48.586 |
| 1518.0 | 48.675 |
| 1519.0 | 48.732 |
| 1520.0 | 48.75 |
| 1521.0 | 48.675 |
| 1522.0 | 48.634 |
| 1523.0 | 48.637 |
| 1524.0 | 48.646 |
| 1525.0 | 48.677 |
| 1526.0 | 48.821 |
| 1527.0 | 48.953 |
| 1528.0 | 49.039 |
| 1529.0 | 49.037 |
| 1530.0 | 48.977 |
| 1531.0 | 48.89 |
| 1532.0 | 48.836 |
| 1533.0 | 48.854 |
| 1534.0 | 48.876 |
| 1535.0 | 48.902 |
| 1536.0 | 48.999 |
| 1537.0 | 49.071 |
| 1538.0 | 49.11 |
| 1539.0 | 49.205 |
| 1540.0 | 49.292 |
| 1541.0 | 49.274 |
| 1542.0 | 49.261 |
| 1543.0 | 49.241 |
| 1544.0 | 49.229 |
| 1545.0 | 49.269 |
| 1546.0 | 49.393 |
| 1547.0 | 49.466 |
| 1548.0 | 49.494 |
| 1549.0 | 49.564 |
| 1550.0 | 49.612 |
| 1551.0 | 49.547 |
| 1552.0 | 49.493 |
| 1553.0 | 49.494 |
| 1554.0 | 49.553 |
| 1555.0 | 49.617 |
| 1556.0 | 49.681 |
| 1557.0 | 49.775 |
| 1558.0 | 49.926 |
| 1559.0 | 50.054 |
| 1560.0 | 50.118 |
| 1561.0 | 50.094 |
| 1562.0 | 50.062 |
| 1563.0 | 50.018 |
| 1564.0 | 49.97 |
| 1565.0 | 49.955 |
| 1566.0 | 50.003 |
| 1567.0 | 50.074 |
| 1568.0 | 50.145 |
| 1569.0 | 50.225 |
| 1570.0 | 50.275 |
| 1571.0 | 50.263 |
| 1572.0 | 50.198 |
| 1573.0 | 50.144 |
| 1574.0 | 50.118 |
| 1575.0 | 50.128 |
| 1576.0 | 50.224 |
| 1577.0 | 50.314 |
| 1578.0 | 50.346 |
| 1579.0 | 50.302 |
| 1580.0 | 50.302 |
| 1581.0 | 50.35 |
| 1582.0 | 50.389 |
| 1583.0 | 50.37 |
| 1584.0 | 50.395 |
| 1585.0 | 50.469 |
| 1586.0 | 50.487 |
| 1587.0 | 50.423 |
| 1588.0 | 50.362 |
| 1589.0 | 50.283 |
| 1590.0 | 50.219 |
| 1591.0 | 50.217 |
| 1592.0 | 50.222 |
| 1593.0 | 50.205 |
| 1594.0 | 50.168 |
| 1595.0 | 50.151 |
| 1596.0 | 50.207 |
| 1597.0 | 50.34 |
| 1598.0 | 50.451 |
| 1599.0 | 50.518 |
| 1600.0 | 50.567 |
| 1601.0 | 50.616 |
| 1602.0 | 50.693 |
| 1603.0 | 50.809 |
| 1604.0 | 50.942 |
| 1605.0 | 50.973 |
| 1606.0 | 50.964 |
| 1607.0 | 50.937 |
| 1608.0 | 50.895 |
| 1609.0 | 50.817 |
| 1610.0 | 50.751 |
| 1611.0 | 50.764 |
| 1612.0 | 50.826 |
| 1613.0 | 50.882 |
| 1614.0 | 50.968 |
| 1615.0 | 51.047 |
| 1616.0 | 51.067 |
| 1617.0 | 51.052 |
| 1618.0 | 51.054 |
| 1619.0 | 51.071 |
| 1620.0 | 51.082 |
| 1621.0 | 51.096 |
| 1622.0 | 51.15 |
| 1623.0 | 51.206 |
| 1624.0 | 51.17 |
| 1625.0 | 51.078 |
| 1626.0 | 50.993 |
| 1627.0 | 50.888 |
| 1628.0 | 50.792 |
| 1629.0 | 50.747 |
| 1630.0 | 50.769 |
| 1631.0 | 50.831 |
| 1632.0 | 50.922 |
| 1633.0 | 50.974 |
| 1634.0 | 50.991 |
| 1635.0 | 51.012 |
| 1636.0 | 51.037 |
| 1637.0 | 51.084 |
| 1638.0 | 51.126 |
| 1639.0 | 51.126 |
| 1640.0 | 51.11 |
| 1641.0 | 51.121 |
| 1642.0 | 51.162 |
| 1643.0 | 51.193 |
| 1644.0 | 51.23 |
| 1645.0 | 51.277 |
| 1646.0 | 51.288 |
| 1647.0 | 51.214 |
| 1648.0 | 51.111 |
| 1649.0 | 51.104 |
| 1650.0 | 51.157 |
| 1651.0 | 51.183 |
| 1652.0 | 51.223 |
| 1653.0 | 51.284 |
| 1654.0 | 51.345 |
| 1655.0 | 51.364 |
| 1656.0 | 51.272 |
| 1657.0 | 51.149 |
| 1658.0 | 51.129 |
| 1659.0 | 51.155 |
| 1660.0 | 51.171 |
| 1661.0 | 51.171 |
| 1662.0 | 51.166 |
| 1663.0 | 51.174 |
| 1664.0 | 51.216 |
| 1665.0 | 51.282 |
| 1666.0 | 51.335 |
| 1667.0 | 51.394 |
| 1668.0 | 51.487 |
| 1669.0 | 51.586 |
| 1670.0 | 51.643 |
| 1671.0 | 51.636 |
| 1672.0 | 51.609 |
| 1673.0 | 51.586 |
| 1674.0 | 51.538 |
| 1675.0 | 51.482 |
| 1676.0 | 51.45 |
| 1677.0 | 51.464 |
| 1678.0 | 51.497 |
| 1679.0 | 51.549 |
| 1680.0 | 51.628 |
| 1681.0 | 51.678 |
| 1682.0 | 51.67 |
| 1683.0 | 51.617 |
| 1684.0 | 51.573 |
| 1685.0 | 51.518 |
| 1686.0 | 51.467 |
| 1687.0 | 51.49 |
| 1688.0 | 51.546 |
| 1689.0 | 51.607 |
| 1690.0 | 51.648 |
| 1691.0 | 51.623 |
| 1692.0 | 51.542 |
| 1693.0 | 51.405 |
| 1694.0 | 51.235 |
| 1695.0 | 51.099 |
| 1696.0 | 51.05 |
| 1697.0 | 51.07 |
| 1698.0 | 51.141 |
| 1699.0 | 51.276 |
| 1700.0 | 51.443 |
| 1701.0 | 51.576 |
| 1702.0 | 51.564 |
| 1703.0 | 51.473 |
| 1704.0 | 51.337 |
| 1705.0 | 51.189 |
| 1706.0 | 51.131 |
| 1707.0 | 51.145 |
| 1708.0 | 51.144 |
| 1709.0 | 51.123 |
| 1710.0 | 51.137 |
| 1711.0 | 51.203 |
| 1712.0 | 51.238 |
| 1713.0 | 51.218 |
| 1714.0 | 51.201 |
| 1715.0 | 51.236 |
| 1716.0 | 51.317 |
| 1717.0 | 51.332 |
| 1718.0 | 51.334 |
| 1719.0 | 51.34 |
| 1720.0 | 51.343 |
| 1721.0 | 51.325 |
| 1722.0 | 51.285 |
| 1723.0 | 51.201 |
| 1724.0 | 51.065 |
| 1725.0 | 50.948 |
| 1726.0 | 50.872 |
| 1727.0 | 50.883 |
| 1728.0 | 50.947 |
| 1729.0 | 51.055 |
| 1730.0 | 51.202 |
| 1731.0 | 51.361 |
| 1732.0 | 51.496 |
| 1733.0 | 51.56 |
| 1734.0 | 51.588 |
| 1735.0 | 51.591 |
| 1736.0 | 51.531 |
| 1737.0 | 51.419 |
| 1738.0 | 51.31 |
| 1739.0 | 51.16 |
| 1740.0 | 50.991 |
| 1741.0 | 50.868 |
| 1742.0 | 50.881 |
| 1743.0 | 50.907 |
| 1744.0 | 50.951 |
| 1745.0 | 51.036 |
| 1746.0 | 51.16 |
| 1747.0 | 51.291 |
| 1748.0 | 51.432 |
| 1749.0 | 51.584 |
| 1750.0 | 51.705 |
| 1751.0 | 51.757 |
| 1752.0 | 51.719 |
| 1753.0 | 51.637 |
| 1754.0 | 51.546 |
| 1755.0 | 51.417 |
| 1756.0 | 51.259 |
| 1757.0 | 51.117 |
| 1758.0 | 51.044 |
| 1759.0 | 51.023 |
| 1760.0 | 51.056 |
| 1761.0 | 51.082 |
| 1762.0 | 51.131 |
| 1763.0 | 51.203 |
| 1764.0 | 51.312 |
| 1765.0 | 51.438 |
| 1766.0 | 51.542 |
| 1767.0 | 51.634 |
| 1768.0 | 51.737 |
| 1769.0 | 51.847 |
| 1770.0 | 51.878 |
| 1771.0 | 51.777 |
| 1772.0 | 51.631 |
| 1773.0 | 51.465 |
| 1774.0 | 51.288 |
| 1775.0 | 51.118 |
| 1776.0 | 51.099 |
| 1777.0 | 51.129 |
| 1778.0 | 51.162 |
| 1779.0 | 51.157 |
| 1780.0 | 51.168 |
| 1781.0 | 51.256 |
| 1782.0 | 51.415 |
| 1783.0 | 51.589 |
| 1784.0 | 51.662 |
| 1785.0 | 51.638 |
| 1786.0 | 51.696 |
| 1787.0 | 51.749 |
| 1788.0 | 51.763 |
| 1789.0 | 51.739 |
| 1790.0 | 51.695 |
| 1791.0 | 51.664 |
| 1792.0 | 51.619 |
| 1793.0 | 51.575 |
| 1794.0 | 51.524 |
| 1795.0 | 51.526 |
| 1796.0 | 51.663 |
| 1797.0 | 51.898 |
| 1798.0 | 51.999 |
| 1799.0 | 52.01 |
| 1800.0 | 52.077 |
| 1801.0 | 52.092 |
| 1802.0 | 52.115 |
| 1803.0 | 52.125 |
| 1804.0 | 52.125 |
| 1805.0 | 52.174 |
| 1806.0 | 52.183 |
| 1807.0 | 52.14 |
| 1808.0 | 52.084 |
| 1809.0 | 51.98 |
| 1810.0 | 51.904 |
| 1811.0 | 51.892 |
| 1812.0 | 51.957 |
| 1813.0 | 52.085 |
| 1814.0 | 52.306 |
| 1815.0 | 52.603 |
| 1816.0 | 52.81 |
| 1817.0 | 52.705 |
| 1818.0 | 52.309 |
| 1819.0 | 51.834 |
| 1820.0 | 51.727 |
| 1821.0 | 51.999 |
| 1822.0 | 52.273 |
| 1823.0 | 52.477 |
| 1824.0 | 52.519 |
| 1825.0 | 52.438 |
| 1826.0 | 52.331 |
| 1827.0 | 52.226 |
| 1828.0 | 52.164 |
| 1829.0 | 52.166 |
| 1830.0 | 52.348 |
| 1831.0 | 52.697 |
| 1832.0 | 52.802 |
| 1833.0 | 52.684 |
| 1834.0 | 52.576 |
| 1835.0 | 52.682 |
| 1836.0 | 52.724 |
| 1837.0 | 52.572 |
| 1838.0 | 52.16 |
| 1839.0 | 51.728 |
| 1840.0 | 51.518 |
| 1841.0 | 51.79 |
| 1842.0 | 52.575 |
| 1843.0 | 53.356 |
| 1844.0 | 53.592 |
| 1845.0 | 53.02 |
| 1846.0 | 52.135 |
| 1847.0 | 51.809 |
| 1848.0 | 52.141 |
| 1849.0 | 52.647 |
| 1850.0 | 52.92 |
| 1851.0 | 52.883 |
| 1852.0 | 52.765 |
| 1853.0 | 52.853 |
| 1854.0 | 53.049 |
| 1855.0 | 53.035 |
| 1856.0 | 52.732 |
| 1857.0 | 52.509 |
| 1858.0 | 52.477 |
| 1859.0 | 52.682 |
| 1860.0 | 52.882 |
| 1861.0 | 53.077 |
| 1862.0 | 53.403 |
| 1863.0 | 53.876 |
| 1864.0 | 54.195 |
| 1865.0 | 54.15 |
| 1866.0 | 53.538 |
| 1867.0 | 52.659 |
| 1868.0 | 52.094 |
| 1869.0 | 52.082 |
| 1870.0 | 52.685 |
| 1871.0 | 53.212 |
| 1872.0 | 53.092 |
| 1873.0 | 52.651 |
| 1874.0 | 52.27 |
| 1875.0 | 52.089 |
| 1876.0 | 52.292 |
| 1877.0 | 52.74 |
| 1878.0 | 53.065 |
| 1879.0 | 53.14 |
| 1880.0 | 53.066 |
| 1881.0 | 52.896 |
| 1882.0 | 52.842 |
| 1883.0 | 52.944 |
| 1884.0 | 53.141 |
| 1885.0 | 53.115 |
| 1886.0 | 53.025 |
| 1887.0 | 52.915 |
| 1888.0 | 52.745 |
| 1889.0 | 52.512 |
| 1890.0 | 52.291 |
| 1891.0 | 52.367 |
| 1892.0 | 52.856 |
| 1893.0 | 53.547 |
| 1894.0 | 54.162 |
| 1895.0 | 54.336 |
| 1896.0 | 54.211 |
| 1897.0 | 53.912 |
| 1898.0 | 53.536 |
| 1899.0 | 53.443 |
| 1900.0 | 53.739 |
| 1901.0 | 53.894 |
| 1902.0 | 53.733 |
| 1903.0 | 53.282 |
| 1904.0 | 52.863 |
| 1905.0 | 52.72 |
| 1906.0 | 53.023 |
| 1907.0 | 53.488 |
| 1908.0 | 53.811 |
| 1909.0 | 53.78 |
| 1910.0 | 53.549 |
| 1911.0 | 53.199 |
| 1912.0 | 52.941 |
| 1913.0 | 53.035 |
| 1914.0 | 53.57 |
| 1915.0 | 54.141 |
| 1916.0 | 54.417 |
| 1917.0 | 54.078 |
| 1918.0 | 53.364 |
| 1919.0 | 52.793 |
| 1920.0 | 52.597 |
| 1921.0 | 52.763 |
| 1922.0 | 53.223 |
| 1923.0 | 53.667 |
| 1924.0 | 53.752 |
| 1925.0 | 53.46 |
| 1926.0 | 53.262 |
| 1927.0 | 53.24 |
| 1928.0 | 53.389 |
| 1929.0 | 53.667 |
| 1930.0 | 53.883 |
| 1931.0 | 53.865 |
| 1932.0 | 53.653 |
| 1933.0 | 53.401 |
| 1934.0 | 53.32 |
| 1935.0 | 53.471 |
| 1936.0 | 53.775 |
| 1937.0 | 53.91 |
| 1938.0 | 53.819 |
| 1939.0 | 53.541 |
| 1940.0 | 53.275 |
| 1941.0 | 53.183 |
| 1942.0 | 53.367 |
| 1943.0 | 53.656 |
| 1944.0 | 53.905 |
| 1945.0 | 54.039 |
| 1946.0 | 54.049 |
| 1947.0 | 54.039 |
| 1948.0 | 54.056 |
| 1949.0 | 54.178 |
| 1950.0 | 54.327 |
| 1951.0 | 54.366 |
| 1952.0 | 54.323 |
| 1953.0 | 54.365 |
| 1954.0 | 54.445 |
| 1955.0 | 54.403 |
| 1956.0 | 54.314 |
| 1957.0 | 54.348 |
| 1958.0 | 54.436 |
| 1959.0 | 54.489 |
| 1960.0 | 54.479 |
| 1961.0 | 54.485 |
| 1962.0 | 54.617 |
| 1963.0 | 54.699 |
| 1964.0 | 54.66 |
| 1965.0 | 54.702 |
| 1966.0 | 54.786 |
| 1967.0 | 54.84 |
| 1968.0 | 54.89 |
| 1969.0 | 54.914 |
| 1970.0 | 54.924 |
| 1971.0 | 55.045 |
| 1972.0 | 55.159 |
| 1973.0 | 55.139 |
| 1974.0 | 55.102 |
| 1975.0 | 55.09 |
| 1976.0 | 55.119 |
| 1977.0 | 55.223 |
| 1978.0 | 55.275 |
| 1979.0 | 55.26 |
| 1980.0 | 55.277 |
| 1981.0 | 55.307 |
| 1982.0 | 55.255 |
| 1983.0 | 55.222 |
| 1984.0 | 55.211 |
| 1985.0 | 55.251 |
| 1986.0 | 55.253 |
| 1987.0 | 55.22 |
| 1988.0 | 55.236 |
| 1989.0 | 55.289 |
| 1990.0 | 55.265 |
| 1991.0 | 55.185 |
| 1992.0 | 55.123 |
| 1993.0 | 55.143 |
| 1994.0 | 55.22 |
| 1995.0 | 55.276 |
| 1996.0 | 55.251 |
| 1997.0 | 55.154 |
| 1998.0 | 55.129 |
| 1999.0 | 55.123 |
| 2000.065834 | 55.123 |
| 2009.942668 | 55.4 |
| 2020.098566 | 55.459 |
| 2029.969298 | 55.642 |
| 2039.837 | 55.763 |
| 2049.98346 | 56.014 |
| 2059.844971 | 56.209 |
| 2069.985031 | 56.421 |
| 2079.840289 | 56.488 |
| 2089.973887 | 56.714 |
| 2099.822832 | 56.915 |
| 2109.949906 | 57.182 |
| 2119.792477 | 57.317 |
| 2129.912964 | 57.447 |
| 2140.030088 | 57.629 |
| 2149.862941 | 57.719 |
| 2159.973384 | 57.842 |
| 2169.799712 | 57.913 |
| 2179.903413 | 58.044 |
| 2190.003671 | 58.163 |
| 2199.820052 | 58.325 |
| 2209.913475 | 58.563 |
| 2219.723179 | 58.688 |
| 2229.809704 | 58.779 |
| 2239.892708 | 58.914 |
| 2249.692237 | 59.054 |
| 2259.76825 | 59.349 |
| 2269.840694 | 59.583 |
| 2279.909553 | 59.813 |
| 2289.695271 | 59.903 |
| 2299.757015 | 60.101 |
| 2309.815127 | 60.415 |
| 2319.869592 | 60.652 |
| 2329.641254 | 60.729 |
| 2339.688478 | 60.778 |
| 2349.732008 | 60.945 |
| 2359.771828 | 61.18 |
| 2369.80792 | 61.204 |
| 2379.840271 | 61.263 |
| 2389.590342 | 61.257 |
| 2399.615266 | 61.354 |
| 2409.6364 | 61.339 |
| 2419.65373 | 61.356 |
| 2429.667238 | 61.472 |
| 2439.676909 | 61.608 |
| 2449.682728 | 61.786 |
| 2459.684679 | 61.851 |
| 2469.682745 | 62.047 |
| 2479.676911 | 62.089 |
| 2489.667162 | 62.24 |
| 2499.653481 | 62.241 |
| 2509.635853 | 62.283 |
| 2519.614261 | 62.309 |
| 2529.588691 | 62.423 |
| 2539.559127 | 62.565 |
| 2549.525552 | 62.58 |
| 2559.487951 | 62.561 |
| 2569.722871 | 62.655 |
| 2579.677058 | 62.774 |
| 2589.627171 | 62.854 |
| 2599.573195 | 62.915 |
| 2609.515113 | 62.947 |
| 2619.452911 | 63.216 |
| 2629.662448 | 63.274 |
| 2639.591842 | 63.323 |
| 2649.517067 | 63.27 |
| 2659.438109 | 63.169 |
| 2669.630358 | 63.086 |
| 2679.542867 | 62.929 |
| 2689.451145 | 62.666 |
| 2699.630227 | 61.987 |
| 2709.529877 | 60.562 |
| 2719.425248 | 57.893 |
| 2729.591015 | 53.383 |
| 2739.477662 | 47.201 |
| 2749.359982 | 40.464 |
| 2759.512287 | 34.352 |
| 2769.385788 | 29.312 |
| 2779.528995 | 25.459 |
| 2789.393611 | 22.768 |
| 2799.527654 | 21.141 |
| 2809.383323 | 20.01 |
| 2819.508136 | 19.284 |
| 2829.354792 | 18.806 |
| 2839.47031 | 18.651 |
| 2849.30789 | 18.512 |
| 2859.414046 | 18.485 |
| 2869.515434 | 18.509 |
| 2879.339216 | 18.819 |
| 2889.431143 | 19.158 |
| 2899.24569 | 19.621 |
| 2909.328092 | 19.947 |
| 2919.40564 | 20.206 |
| 2929.206149 | 20.605 |
| 2939.274073 | 21.032 |
| 2949.337095 | 21.516 |
| 2959.395197 | 21.907 |
| 2969.17672 | 22.401 |
| 2979.225066 | 22.874 |
| 2989.268442 | 23.407 |
| 2999.306833 | 23.91 |
| 3009.34022 | 24.368 |
| 3019.368587 | 24.817 |
| 3029.391918 | 25.206 |
| 3039.139497 | 25.667 |
| 3049.152842 | 26.051 |
| 3059.1611 | 26.442 |
| 3069.164256 | 26.83 |
| 3079.162292 | 27.404 |
| 3089.155191 | 27.995 |
| 3099.142938 | 28.674 |
| 3109.125515 | 29.105 |
| 3119.102905 | 29.722 |
| 3129.075093 | 30.253 |
| 3139.311366 | 30.814 |
| 3149.272956 | 31.347 |
| 3159.229293 | 31.913 |
| 3169.18036 | 32.417 |
| 3179.126141 | 32.964 |
| 3189.066618 | 33.501 |
| 3199.27022 | 34.029 |
| 3209.199897 | 34.501 |
| 3219.124221 | 34.792 |
| 3229.043176 | 35.381 |
| 3239.224603 | 35.755 |
| 3249.132622 | 36.311 |
| 3259.035221 | 36.67 |
| 3269.199799 | 37.083 |
| 3279.091361 | 37.245 |
| 3288.977454 | 37.345 |
| 3299.125027 | 37.455 |
| 3308.999981 | 37.355 |
| 3319.136081 | 37.183 |
| 3328.999829 | 36.789 |
| 3339.124385 | 36.531 |
| 3348.976861 | 36.13 |
| 3359.089804 | 35.472 |
| 3368.930939 | 34.809 |
| 3379.0322 | 34.051 |
| 3389.127517 | 33.192 |
| 3398.951437 | 32.149 |
| 3409.034967 | 30.949 |
| 3419.112499 | 29.701 |
| 3428.919052 | 28.232 |
| 3438.984693 | 26.643 |
| 3449.044284 | 25.046 |
| 3458.833318 | 23.717 |
| 3468.880914 | 22.45 |
| 3478.922407 | 21.234 |
| 3488.957779 | 19.883 |
| 3498.987012 | 18.49 |
| 3509.010089 | 17.032 |
| 3519.026992 | 15.696 |
| 3529.037703 | 14.604 |
| 3538.779008 | 13.561 |
| 3548.777448 | 12.582 |
| 3558.769643 | 11.691 |
| 3568.755577 | 10.917 |
| 3578.997769 | 10.186 |
| 3588.970961 | 9.368 |
| 3598.937838 | 8.864 |
| 3608.898383 | 8.305 |
| 3618.852578 | 7.94 |
| 3628.800407 | 7.701 |
| 3638.74185 | 7.388 |
| 3648.938253 | 7.218 |
| 3658.866705 | 7.047 |
| 3668.788719 | 7.038 |
| 3678.704279 | 7.161 |
| 3688.874043 | 7.225 |
| 3698.776469 | 7.8 |
| 3708.672387 | 8.25 |
| 3718.821938 | 8.629 |
| 3728.704616 | 8.929 |
| 3738.840542 | 9.445 |
| 3748.709907 | 10.216 |
| 3758.832135 | 11.01 |
| 3768.688117 | 11.84 |
| 3778.796573 | 12.72 |
| 3788.639101 | 13.351 |
| 3798.733711 | 13.895 |
| 3808.821282 | 14.913 |
| 3818.643407 | 15.671 |
| 3828.717023 | 16.063 |
| 3838.783543 | 16.003 |
| 3848.585104 | 15.982 |
| 3858.637559 | 16.165 |
| 3868.682864 | 15.841 |
| 3878.720999 | 15.876 |
| 3888.751945 | 15.556 |
| 3898.518755 | 15.267 |
| 3908.535455 | 14.797 |
| 3918.54491 | 14.583 |
| 3928.547104 | 14.237 |
| 3938.542016 | 13.514 |
| 3948.52963 | 12.982 |
| 3958.509925 | 12.509 |
| 3968.482884 | 12.526 |
| 3978.70392 | 12.002 |
| 3988.661962 | 11.72 |
| 3998.612612 | 11.076 |
| 4008.555852 | 10.876 |
| 4018.491662 | 10.608 |
| 4028.6745 | 10.61 |
| 4038.595205 | 10.515 |
| 4048.508426 | 10.575 |
| 4058.414143 | 10.549 |
| 4068.56604 | 10.681 |
| 4078.456503 | 10.597 |
| 4088.592715 | 10.861 |
| 4098.467848 | 10.671 |
| 4108.588299 | 11.093 |
| 4118.448027 | 10.999 |
| 4128.552639 | 11.343 |
| 4138.396887 | 11.173 |
| 4148.485584 | 11.546 |
| 4158.566193 | 11.731 |
| 4168.386981 | 11.914 |
| 4178.45156 | 11.755 |
| 4188.507992 | 11.678 |
| 4198.305151 | 11.639 |
| 4208.345437 | 11.289 |
| 4218.377519 | 10.631 |
| 4228.401377 | 10.088 |
| 4238.416991 | 10.233 |
| 4248.424343 | 10.967 |
| 4258.423411 | 10.705 |
| 4268.414178 | 10.093 |
| 4278.396623 | 9.632 |
| 4288.370728 | 9.854 |
| 4298.336471 | 9.239 |
| 4308.293836 | 8.404 |
| 4318.2428 | 7.793 |
| 4328.431752 | 7.929 |
| 4338.363649 | 7.735 |
| 4348.287088 | 7.583 |
| 4358.20205 | 7.49 |
| 4368.356068 | 7.251 |
| 4378.253805 | 6.681 |
| 4388.390126 | 5.984 |
| 4398.270558 | 5.665 |
| 4408.389101 | 5.382 |
| 4418.252149 | 5.266 |
| 4428.352834 | 4.775 |
| 4438.198419 | 4.569 |
| 4448.281165 | 4.118 |
| 4458.354799 | 3.817 |
| 4468.173935 | 3.323 |
| 4478.229508 | 3.007 |
| 4488.275909 | 2.868 |
| 4498.313117 | 2.877 |
| 4508.096635 | 2.819 |
| 4518.115621 | 2.819 |
| 4528.125352 | 2.776 |
| 4538.125809 | 2.606 |
| 4548.11697 | 2.467 |
| 4558.098816 | 2.324 |
| 4568.071325 | 2.229 |
| 4578.277365 | 2.12 |
| 4588.230912 | 2.015 |
| 4598.175061 | 1.927 |
| 4608.109792 | 1.853 |
| 4618.035085 | 1.787 |
| 4628.192649 | 1.717 |
| 4638.098772 | 1.651 |
| 4647.995395 | 1.58 |
| 4658.123528 | 1.516 |
| 4668.000857 | 1.453 |
| 4678.109183 | 1.395 |
| 4687.967136 | 1.333 |
| 4698.05557 | 1.283 |
| 4708.133906 | 1.228 |
| 4717.962521 | 1.192 |
| 4728.020838 | 1.157 |
| 4738.068993 | 1.136 |
| 4748.106964 | 1.109 |
| 4758.13473 | 1.081 |
| 4767.913874 | 1.048 |
| 4777.921408 | 1.018 |
| 4787.918673 | 0.992 |
| 4797.905646 | 0.966 |
| 4807.882307 | 0.934 |
| 4818.085802 | 0.905 |
| 4828.041526 | 0.884 |
| 4837.986874 | 0.868 |
| 4847.921823 | 0.852 |
| 4857.846351 | 0.834 |
| 4867.996361 | 0.816 |
| 4877.899737 | 0.796 |
| 4888.028045 | 0.777 |
| 4897.910179 | 0.757 |
| 4908.016697 | 0.74 |
| 4917.877504 | 0.732 |
| 4927.962141 | 0.719 |
| 4937.801534 | 0.703 |
| 4947.864203 | 0.691 |
| 4957.915724 | 0.681 |
| 4967.956075 | 0.67 |
| 4977.985234 | 0.657 |
| 4987.77033 | 0.645 |
| 4997.777298 | 0.632 |
| 5007.776688 | 0.623 |
| 5017.595804 | 0.614 |
| 5028.169082 | 0.603 |
| 5037.98605 | 0.593 |
| 5047.80198 | 0.583 |
| 5057.616872 | 0.574 |
| 5068.18559 | 0.564 |
| 5077.998316 | 0.554 |
| 5087.809996 | 0.545 |
| 5097.620628 | 0.538 |
| 5107.430211 | 0.53 |
| 5117.993201 | 0.522 |
| 5127.800597 | 0.515 |
| 5137.606938 | 0.507 |
| 5147.41222 | 0.501 |
| 5157.970569 | 0.494 |
| 5167.773648 | 0.487 |
| 5177.575662 | 0.48 |
| 5187.376611 | 0.474 |
| 5197.930283 | 0.467 |
| 5207.729011 | 0.462 |
| 5217.526666 | 0.46 |
| 5227.323247 | 0.458 |
| 5237.872207 | 0.455 |
| 5247.666549 | 0.451 |
| 5257.459812 | 0.447 |
| 5268.005191 | 0.445 |
| 5277.796202 | 0.443 |
| 5287.586127 | 0.439 |
| 5297.374963 | 0.435 |
| 5307.915566 | 0.433 |
| 5317.702134 | 0.429 |
| 5327.487607 | 0.425 |
| 5337.271982 | 0.422 |
| 5347.807773 | 0.418 |
| 5357.589864 | 0.414 |
| 5367.370852 | 0.412 |
| 5377.902987 | 0.411 |
| 5387.681677 | 0.408 |
| 5397.459258 | 0.404 |
| 5407.235727 | 0.403 |
| 5417.762987 | 0.399 |
| 5427.537141 | 0.395 |
| 5437.310177 | 0.394 |
| 5447.833734 | 0.393 |
| 5457.604442 | 0.391 |
| 5467.374028 | 0.387 |
| 5477.142487 | 0.383 |
| 5487.661104 | 0.379 |
| 5497.427219 | 0.377 |
| 5507.192201 | 0.374 |
| 5517.707068 | 0.37 |
| 5527.469693 | 0.369 |
| 5537.231179 | 0.367 |
| 5547.742274 | 0.367 |
| 5557.50139 | 0.367 |
| 5567.259362 | 0.367 |
| 5577.766665 | 0.365 |
| 5587.522253 | 0.362 |
| 5597.276691 | 0.36 |
| 5607.780182 | 0.358 |
| 5617.532223 | 0.357 |
| 5627.283108 | 0.357 |
| 5637.032835 | 0.357 |
| 5647.531242 | 0.355 |
| 5657.278555 | 0.353 |
| 5667.024703 | 0.351 |
| 5677.51925 | 0.349 |
| 5687.262972 | 0.348 |
| 5697.005523 | 0.349 |
| 5707.496189 | 0.349 |
| 5717.236302 | 0.347 |
| 5726.975237 | 0.346 |
| 5737.462002 | 0.349 |
| 5747.198485 | 0.352 |
| 5757.682605 | 0.353 |
| 5767.416629 | 0.352 |
| 5777.149464 | 0.35 |
| 5787.629649 | 0.347 |
| 5797.360012 | 0.345 |
| 5807.08918 | 0.343 |
| 5817.565409 | 0.34 |
| 5827.292092 | 0.338 |
| 5837.017575 | 0.336 |
| 5847.489828 | 0.334 |
| 5857.212813 | 0.332 |
| 5866.934591 | 0.33 |
| 5877.402847 | 0.329 |
| 5887.122114 | 0.327 |
| 5897.587661 | 0.325 |
| 5907.304408 | 0.323 |
| 5917.019938 | 0.322 |
| 5927.481454 | 0.32 |
| 5937.194452 | 0.319 |
| 5946.906226 | 0.322 |
| 5957.363691 | 0.325 |
| 5967.072921 | 0.328 |
| 5977.52764 | 0.329 |
| 5987.234315 | 0.328 |
| 5996.939757 | 0.327 |
| 6007.39039 | 0.325 |
| 6017.093265 | 0.324 |
| 6026.794901 | 0.323 |
| 6037.241429 | 0.323 |
| 6046.940485 | 0.324 |
| 6057.38423 | 0.325 |
| 6067.080698 | 0.324 |
| 6076.775917 | 0.322 |
| 6087.215522 | 0.321 |
| 6096.908139 | 0.321 |
| 6107.344938 | 0.319 |
| 6117.034946 | 0.317 |
| 6126.723694 | 0.317 |
| 6137.156319 | 0.315 |
| 6146.842444 | 0.314 |
| 6157.272241 | 0.312 |
| 6166.955735 | 0.311 |
| 6177.382693 | 0.31 |
| 6187.063548 | 0.309 |
| 6196.743128 | 0.307 |
| 6207.165865 | 0.306 |
| 6216.842793 | 0.305 |
| 6227.262668 | 0.304 |
| 6236.936935 | 0.303 |
| 6246.609918 | 0.302 |
| 6257.025537 | 0.302 |
| 6266.695846 | 0.302 |
| 6277.108582 | 0.301 |
| 6286.776208 | 0.3 |
| 6297.18605 | 0.299 |
| 6306.850986 | 0.298 |
| 6317.257926 | 0.298 |
| 6326.920162 | 0.298 |
| 6336.581095 | 0.297 |
| 6346.983717 | 0.295 |
| 6356.641938 | 0.294 |
| 6367.041635 | 0.293 |
| 6376.697135 | 0.293 |
| 6387.093897 | 0.294 |
| 6396.746668 | 0.295 |
| 6407.140486 | 0.295 |
| 6416.790518 | 0.296 |
| 6427.181383 | 0.297 |
| 6436.828669 | 0.298 |
| 6446.47463 | 0.299 |
| 6456.861103 | 0.299 |
| 6466.504304 | 0.297 |
| 6476.8878 | 0.296 |
| 6486.528234 | 0.296 |
| 6496.908745 | 0.294 |
| 6506.546402 | 0.294 |
| 6516.923919 | 0.295 |
| 6526.558791 | 0.294 |
| 6536.933304 | 0.295 |
| 6546.565382 | 0.295 |
| 6556.936882 | 0.295 |
| 6566.566159 | 0.295 |
| 6576.934637 | 0.295 |
| 6586.561102 | 0.297 |
| 6596.926549 | 0.297 |
| 6606.550195 | 0.296 |
| 6616.912601 | 0.295 |
| 6626.53342 | 0.294 |
| 6636.892776 | 0.293 |
| 6646.510758 | 0.294 |
| 6656.867055 | 0.296 |
| 6666.482193 | 0.298 |
| 6676.835422 | 0.3 |
| 6686.447706 | 0.3 |
| 6696.797857 | 0.3 |
| 6706.40728 | 0.299 |
| 6716.754344 | 0.299 |
| 6726.360896 | 0.298 |
| 6736.704865 | 0.297 |
| 6746.308538 | 0.298 |
| 6756.649402 | 0.298 |
| 6766.250188 | 0.298 |
| 6776.587937 | 0.297 |
| 6786.924068 | 0.296 |
| 6796.520453 | 0.295 |
| 6806.853456 | 0.294 |
| 6816.446931 | 0.293 |
| 6826.776797 | 0.292 |
| 6836.367355 | 0.291 |
| 6846.694074 | 0.29 |
| 6856.281707 | 0.29 |
| 6866.60527 | 0.29 |
| 6876.189968 | 0.29 |
| 6886.510366 | 0.29 |
| 6896.82912 | 0.292 |
| 6906.409345 | 0.292 |
| 6916.724921 | 0.292 |
| 6926.30219 | 0.292 |
| 6936.614577 | 0.292 |
| 6946.188882 | 0.292 |
| 6956.498072 | 0.292 |
| 6966.805601 | 0.29 |
| 6976.375388 | 0.29 |
| 6986.679706 | 0.289 |
| 6996.246507 | 0.288 |
| 7006.547605 | 0.287 |
| 7016.111412 | 0.287 |
| 7026.40928 | 0.286 |
| 7036.70547 | 0.285 |
| 7046.264714 | 0.284 |
| 7056.557661 | 0.284 |
| 7066.113889 | 0.284 |
| 7076.403584 | 0.284 |
| 7086.691589 | 0.283 |
| 7096.243221 | 0.282 |
| 7106.527959 | 0.281 |
| 7116.076554 | 0.281 |
| 7126.358018 | 0.281 |
| 7136.637779 | 0.28 |
| 7146.181746 | 0.279 |
| 7156.458218 | 0.279 |
| 7165.999126 | 0.28 |
| 7176.2723 | 0.28 |
| 7186.54376 | 0.279 |
| 7196.080008 | 0.278 |
| 7206.348156 | 0.277 |
| 7216.614582 | 0.276 |
| 7226.14615 | 0.275 |
| 7236.409251 | 0.274 |
| 7245.937725 | 0.274 |
| 7256.197491 | 0.273 |
| 7266.455524 | 0.272 |
| 7275.979286 | 0.272 |
| 7286.23397 | 0.272 |
| 7296.486914 | 0.272 |
| 7306.005944 | 0.271 |
| 7316.255525 | 0.271 |
| 7326.503358 | 0.27 |
| 7336.017637 | 0.269 |
| 7346.262094 | 0.269 |
| 7356.504797 | 0.269 |
| 7366.014304 | 0.269 |
| 7376.253616 | 0.268 |
| 7386.491167 | 0.268 |
| 7395.995884 | 0.267 |
| 7406.23003 | 0.266 |
| 7416.462408 | 0.265 |
| 7425.962315 | 0.265 |
| 7436.191274 | 0.265 |
| 7446.418458 | 0.265 |
| 7455.913536 | 0.264 |
| 7466.137287 | 0.264 |
| 7476.359256 | 0.263 |
| 7485.849485 | 0.264 |
| 7496.068008 | 0.264 |
| 7506.284741 | 0.264 |
| 7515.770101 | 0.264 |
| 7525.983375 | 0.263 |
| 7536.19485 | 0.263 |
| 7545.675324 | 0.262 |
| 7555.883326 | 0.261 |
| 7566.089524 | 0.261 |
| 7576.293916 | 0.26 |
| 7585.767802 | 0.26 |
| 7595.968701 | 0.26 |
| 7606.167786 | 0.259 |
| 7615.636739 | 0.258 |
| 7625.832319 | 0.257 |
| 7636.026078 | 0.257 |
| 7646.218013 | 0.257 |
| 7655.680318 | 0.257 |
| 7665.868729 | 0.257 |
| 7676.05531 | 0.257 |
| 7686.240057 | 0.257 |
| 7695.695679 | 0.256 |
| 7705.876884 | 0.256 |
| 7716.056248 | 0.255 |
| 7726.23377 | 0.255 |
| 7735.682674 | 0.255 |
| 7745.856636 | 0.255 |
| 7756.028747 | 0.255 |
| 7766.199006 | 0.255 |
| 7775.641157 | 0.255 |
| 7785.807837 | 0.255 |
| 7795.972657 | 0.254 |
| 7806.135616 | 0.254 |
| 7815.57098 | 0.253 |
| 7825.730341 | 0.252 |
| 7835.887833 | 0.252 |
| 7846.043454 | 0.252 |
| 7855.471995 | 0.251 |
| 7865.624 | 0.251 |
| 7875.774127 | 0.25 |
| 7885.922372 | 0.249 |
| 7896.068734 | 0.249 |
| 7905.488668 | 0.249 |
| 7915.631391 | 0.249 |
| 7925.772224 | 0.249 |
| 7935.911164 | 0.25 |
| 7946.048209 | 0.25 |
| 7955.45948 | 0.25 |
| 7965.592863 | 0.249 |
| 7975.724343 | 0.249 |
| 7985.853919 | 0.248 |
| 7995.981587 | 0.248 |
| 8005.384141 | 0.247 |
| 8015.508125 | 0.247 |
| 8025.630194 | 0.247 |
| 8035.750346 | 0.248 |
| 8045.86858 | 0.247 |
| 8055.984892 | 0.247 |
| 8065.376887 | 0.247 |
| 8075.489487 | 0.247 |
| 8085.600158 | 0.247 |
| 8095.708897 | 0.247 |
| 8105.815704 | 0.247 |
| 8115.920574 | 0.247 |
| 8125.301933 | 0.246 |
| 8135.403063 | 0.246 |
| 8145.502251 | 0.245 |
| 8155.599493 | 0.245 |
| 8165.694787 | 0.245 |
| 8175.788131 | 0.244 |
| 8185.879523 | 0.244 |
| 8195.248351 | 0.243 |
| 8205.33597 | 0.243 |
| 8215.42163 | 0.243 |
| 8225.505327 | 0.242 |
| 8235.587061 | 0.242 |
| 8245.666827 | 0.242 |
| 8255.744624 | 0.241 |
| 8265.82045 | 0.24 |
| 8275.174806 | 0.24 |
| 8285.246822 | 0.24 |
| 8295.31686 | 0.239 |
| 8305.384917 | 0.239 |
| 8315.45099 | 0.238 |
| 8325.515077 | 0.238 |
| 8335.577176 | 0.238 |
| 8345.637284 | 0.237 |
| 8355.695399 | 0.237 |
| 8365.751519 | 0.237 |
| 8375.087555 | 0.237 |
| 8385.139819 | 0.237 |
| 8395.190081 | 0.237 |
| 8405.238338 | 0.237 |
| 8415.284587 | 0.236 |
| 8425.328827 | 0.236 |
| 8435.371055 | 0.235 |
| 8445.411268 | 0.235 |
| 8455.449464 | 0.235 |
| 8465.485641 | 0.235 |
| 8475.519796 | 0.235 |
| 8485.551927 | 0.235 |
| 8495.582031 | 0.235 |
| 8505.610107 | 0.234 |
| 8515.636151 | 0.234 |
| 8525.660162 | 0.234 |
| 8535.682136 | 0.233 |
| 8544.98643 | 0.233 |
| 8555.004471 | 0.233 |
| 8565.020468 | 0.233 |
| 8575.034421 | 0.233 |
| 8585.046325 | 0.233 |
| 8595.056179 | 0.233 |
| 8605.063981 | 0.233 |
| 8615.069727 | 0.232 |
| 8625.073416 | 0.232 |
| 8635.075045 | 0.231 |
| 8645.074612 | 0.231 |
| 8655.072114 | 0.231 |
| 8665.067549 | 0.23 |
| 8675.060915 | 0.23 |
| 8685.052209 | 0.23 |
| 8695.041429 | 0.229 |
| 8705.028573 | 0.229 |
| 8715.013637 | 0.229 |
| 8724.99662 | 0.229 |
| 8734.977519 | 0.228 |
| 8744.956333 | 0.228 |
| 8754.933058 | 0.228 |
| 8764.907692 | 0.228 |
| 8774.880232 | 0.227 |
| 8784.850677 | 0.227 |
| 8794.819025 | 0.227 |
| 8804.785271 | 0.227 |
| 8815.461059 | 0.228 |
| 8825.422948 | 0.228 |
| 8835.382728 | 0.227 |
| 8845.340399 | 0.228 |
| 8855.295957 | 0.228 |
| 8865.249401 | 0.228 |
| 8875.200727 | 0.228 |
| 8885.149933 | 0.228 |
| 8895.097018 | 0.227 |
| 8905.041978 | 0.227 |
| 8914.984812 | 0.227 |
| 8924.925517 | 0.227 |
| 8934.86409 | 0.226 |
| 8944.800529 | 0.226 |
| 8954.734832 | 0.226 |
| 8965.376355 | 0.226 |
| 8975.306225 | 0.225 |
| 8985.233952 | 0.225 |
| 8995.159534 | 0.225 |
| 9005.082967 | 0.225 |
| 9015.004249 | 0.224 |
| 9024.923378 | 0.224 |
| 9034.840353 | 0.224 |
| 9044.755169 | 0.224 |
| 9054.667825 | 0.223 |
| 9065.286129 | 0.223 |
| 9075.194303 | 0.223 |
| 9085.10031 | 0.223 |
| 9095.004147 | 0.223 |
| 9104.905813 | 0.223 |
| 9114.805303 | 0.222 |
| 9124.702617 | 0.223 |
| 9134.597752 | 0.222 |
| 9145.197262 | 0.222 |
| 9155.087875 | 0.222 |
| 9164.976302 | 0.221 |
| 9174.86254 | 0.221 |
| 9184.746587 | 0.222 |
| 9194.628441 | 0.222 |
| 9204.508098 | 0.223 |
| 9215.091006 | 0.223 |
| 9224.966108 | 0.223 |
| 9234.839006 | 0.223 |
| 9244.709699 | 0.223 |
| 9254.578185 | 0.223 |
| 9265.149109 | 0.223 |
| 9275.013013 | 0.222 |
| 9284.874702 | 0.222 |
| 9294.734174 | 0.222 |
| 9304.591426 | 0.222 |
| 9314.446456 | 0.221 |
| 9325.002949 | 0.221 |
| 9334.853368 | 0.221 |
| 9344.701558 | 0.22 |
| 9354.547517 | 0.22 |
| 9364.391241 | 0.22 |
| 9374.935607 | 0.219 |
| 9384.774696 | 0.219 |
| 9394.611544 | 0.219 |
| 9404.446148 | 0.218 |
| 9414.980732 | 0.218 |
| 9424.810682 | 0.218 |
| 9434.63838 | 0.217 |
| 9444.463825 | 0.217 |
| 9454.988585 | 0.218 |
| 9464.809356 | 0.217 |
| 9474.627866 | 0.217 |
| 9484.444114 | 0.217 |
| 9494.959008 | 0.217 |
| 9504.770561 | 0.217 |
| 9514.579844 | 0.216 |
| 9524.386855 | 0.216 |
| 9534.891842 | 0.216 |
| 9544.694139 | 0.216 |
| 9554.494156 | 0.215 |
| 9564.291891 | 0.215 |
| 9574.786929 | 0.215 |
| 9584.57993 | 0.215 |
| 9594.370643 | 0.215 |
| 9604.858149 | 0.215 |
| 9614.644112 | 0.215 |
| 9624.427779 | 0.215 |
| 9634.209147 | 0.215 |
| 9644.686632 | 0.215 |
| 9654.463232 | 0.214 |
| 9664.237526 | 0.214 |
| 9674.707423 | 0.214 |
| 9684.476934 | 0.213 |
| 9694.244132 | 0.213 |
| 9704.706417 | 0.213 |
| 9714.468817 | 0.212 |
| 9724.228897 | 0.212 |
| 9734.683548 | 0.212 |
| 9744.438814 | 0.212 |
| 9754.191753 | 0.212 |
| 9764.638746 | 0.212 |
| 9774.386857 | 0.212 |
| 9784.132634 | 0.211 |
| 9794.571945 | 0.211 |
| 9804.312879 | 0.211 |
| 9814.746996 | 0.21 |
| 9824.483078 | 0.21 |
| 9834.216813 | 0.21 |
| 9844.643209 | 0.21 |
| 9854.372076 | 0.21 |
| 9864.09859 | 0.21 |
| 9874.517241 | 0.211 |
| 9884.238873 | 0.211 |
| 9894.652288 | 0.211 |
| 9904.369027 | 0.211 |
| 9914.083402 | 0.211 |
| 9924.489032 | 0.211 |
| 9934.198499 | 0.211 |
| 9944.598867 | 0.211 |
| 9954.303417 | 0.21 |
| 9964.00559 | 0.21 |
| 9974.398135 | 0.21 |
| 9984.095376 | 0.21 |
| 9994.482631 | 0.209 |
| 10004.17493 | 0.21 |
| 10014.55689 | 0.21 |
| 10024.24423 | 0.21 |
| 10033.92919 | 0.209 |
| 10044.30326 | 0.209 |
| 10053.98325 | 0.209 |
| 10064.352 | 0.209 |
| 10074.02701 | 0.208 |
| 10084.39043 | 0.208 |
| 10094.06045 | 0.208 |
| 10104.41852 | 0.209 |
| 10114.08355 | 0.208 |
| 10124.43625 | 0.208 |
| 10134.09628 | 0.208 |
| 10144.44362 | 0.208 |
| 10154.09862 | 0.209 |
| 10164.44058 | 0.208 |
| 10174.09056 | 0.208 |
| 10184.42713 | 0.208 |
| 10194.07208 | 0.208 |
| 10204.40325 | 0.208 |
| 10214.04315 | 0.207 |
| 10224.36891 | 0.207 |
| 10234.00375 | 0.207 |
| 10244.32409 | 0.207 |
| 10253.95386 | 0.207 |
| 10264.26877 | 0.207 |
| 10273.89347 | 0.206 |
| 10284.20293 | 0.206 |
| 10293.82255 | 0.206 |
| 10304.12656 | 0.206 |
| 10313.74108 | 0.206 |
| 10324.03963 | 0.206 |
| 10334.33534 | 0.206 |
| 10343.94211 | 0.205 |
| 10354.23234 | 0.206 |
| 10363.834 | 0.206 |
| 10374.11874 | 0.205 |
| 10383.71527 | 0.206 |
| 10393.99451 | 0.206 |
| 10404.2709 | 0.206 |
| 10413.85962 | 0.206 |
| 10424.1305 | 0.206 |
| 10433.71407 | 0.206 |
| 10443.97941 | 0.206 |
| 10454.2419 | 0.207 |
| 10463.81763 | 0.207 |
| 10474.07457 | 0.207 |
| 10483.64512 | 0.206 |
| 10493.8965 | 0.206 |
| 10504.14501 | 0.206 |
| 10513.70769 | 0.206 |
| 10523.95063 | 0.206 |
| 10534.19068 | 0.206 |
| 10543.74545 | 0.206 |
| 10553.97992 | 0.206 |
| 10564.21149 | 0.206 |
| 10573.75835 | 0.205 |
| 10583.98432 | 0.205 |
| 10593.52594 | 0.205 |
| 10603.7463 | 0.205 |
| 10613.96375 | 0.205 |
| 10624.17829 | 0.205 |
| 10633.70924 | 0.205 |
| 10643.91815 | 0.205 |
| 10654.12414 | 0.204 |
| 10663.64709 | 0.205 |
| 10673.84743 | 0.204 |
| 10684.04485 | 0.204 |
| 10693.55979 | 0.204 |
| 10703.75154 | 0.204 |
| 10713.94035 | 0.204 |
| 10723.44726 | 0.204 |
| 10733.6304 | 0.204 |
| 10743.81059 | 0.204 |
| 10753.98783 | 0.204 |
| 10763.48393 | 0.204 |
| 10773.65548 | 0.204 |
| 10783.82407 | 0.204 |
| 10793.9897 | 0.203 |
| 10803.47495 | 0.203 |
| 10813.63486 | 0.203 |
| 10823.7918 | 0.203 |
| 10833.94578 | 0.204 |
| 10843.42014 | 0.203 |
| 10853.56838 | 0.203 |
| 10863.71363 | 0.203 |
| 10873.85591 | 0.203 |
| 10883.31935 | 0.204 |
| 10893.45586 | 0.204 |
| 10903.58938 | 0.204 |
| 10913.71992 | 0.204 |
| 10923.84746 | 0.204 |
| 10933.29714 | 0.204 |
| 10943.41889 | 0.204 |
| 10953.53764 | 0.204 |
| 10963.65339 | 0.204 |
| 10973.76613 | 0.204 |
| 10983.87586 | 0.204 |
| 10993.3089 | 0.204 |
| 11003.41281 | 0.204 |
| 11013.5137 | 0.205 |
| 11023.61157 | 0.205 |
| 11033.70642 | 0.205 |
| 11043.79825 | 0.206 |
| 11053.21456 | 0.206 |
| 11063.30053 | 0.206 |
| 11073.38346 | 0.206 |
| 11083.46337 | 0.206 |
| 11093.54023 | 0.206 |
| 11103.61405 | 0.206 |
| 11113.68483 | 0.206 |
| 11123.75256 | 0.206 |
| 11133.14635 | 0.206 |
| 11143.20819 | 0.206 |
| 11153.26696 | 0.205 |
| 11163.32268 | 0.205 |
| 11173.37534 | 0.205 |
| 11183.42494 | 0.205 |
| 11193.47147 | 0.205 |
| 11203.51493 | 0.204 |
| 11213.55532 | 0.204 |
| 11223.59263 | 0.204 |
| 11233.62687 | 0.204 |
| 11243.65803 | 0.204 |
| 11253.6861 | 0.204 |
| 11263.71109 | 0.203 |
| 11273.06496 | 0.203 |
| 11283.08398 | 0.203 |
| 11293.09991 | 0.203 |
| 11303.11274 | 0.203 |
| 11313.12247 | 0.204 |
| 11323.12909 | 0.204 |
| 11333.13262 | 0.205 |
| 11343.13303 | 0.205 |
| 11353.13034 | 0.204 |
| 11363.12453 | 0.204 |
| 11373.11561 | 0.204 |
| 11383.10358 | 0.204 |
| 11393.08842 | 0.204 |
| 11403.07013 | 0.204 |
| 11413.04872 | 0.204 |
| 11423.02418 | 0.203 |
| 11432.99651 | 0.204 |
| 11442.96571 | 0.204 |
| 11452.93177 | 0.204 |
| 11463.55877 | 0.204 |
| 11473.51834 | 0.204 |
| 11483.47476 | 0.204 |
| 11493.42803 | 0.204 |
| 11503.37815 | 0.204 |
| 11513.32512 | 0.204 |
| 11523.26893 | 0.204 |
| 11533.20958 | 0.204 |
| 11543.14707 | 0.204 |
| 11553.0814 | 0.204 |
| 11563.01256 | 0.204 |
| 11572.94055 | 0.204 |
| 11582.86536 | 0.204 |
| 11593.44833 | 0.204 |
| 11603.36658 | 0.204 |
| 11613.28165 | 0.204 |
| 11623.19353 | 0.204 |
| 11633.10223 | 0.204 |
| 11643.00774 | 0.204 |
| 11652.91006 | 0.204 |
| 11662.80918 | 0.204 |
| 11673.36472 | 0.204 |
| 11683.25723 | 0.204 |
| 11693.14654 | 0.204 |
| 11703.03264 | 0.204 |
| 11712.91554 | 0.204 |
| 11722.79522 | 0.204 |
| 11733.33001 | 0.204 |
| 11743.20304 | 0.204 |
| 11753.07286 | 0.204 |
| 11762.93946 | 0.204 |
| 11772.80283 | 0.204 |
| 11783.3202 | 0.204 |
| 11793.1769 | 0.204 |
| 11803.03036 | 0.204 |
| 11812.88059 | 0.204 |
| 11822.72758 | 0.204 |
| 11833.22747 | 0.203 |
| 11843.06776 | 0.204 |
| 11852.9048 | 0.204 |
| 11862.73859 | 0.204 |
| 11873.22439 | 0.204 |
| 11883.05145 | 0.205 |
| 11892.87526 | 0.205 |
| 11902.69581 | 0.205 |
| 11913.16747 | 0.205 |
| 11922.98127 | 0.205 |
| 11932.79181 | 0.205 |
| 11942.59907 | 0.205 |
| 11953.05654 | 0.205 |
| 11962.85704 | 0.205 |
| 11972.65425 | 0.206 |
| 11983.10099 | 0.206 |
| 11992.89142 | 0.206 |
| 12002.67856 | 0.206 |
| 12013.11455 | 0.207 |
| 12022.89488 | 0.206 |
| 12032.67192 | 0.206 |
| 12043.09713 | 0.206 |
| 12052.86735 | 0.206 |
| 12062.63426 | 0.206 |
| 12073.04866 | 0.206 |
| 12082.80874 | 0.206 |
| 12092.5655 | 0.206 |
| 12102.96906 | 0.206 |
| 12112.71897 | 0.206 |
| 12122.46556 | 0.206 |
| 12132.85826 | 0.206 |
| 12142.59798 | 0.206 |
| 12152.98334 | 0.206 |
| 12162.71618 | 0.205 |
| 12172.44568 | 0.206 |
| 12182.82013 | 0.206 |
| 12192.54273 | 0.206 |
| 12202.90982 | 0.206 |
| 12212.62551 | 0.206 |
| 12222.98523 | 0.206 |
| 12232.69399 | 0.205 |
| 12242.39941 | 0.206 |
| 12252.74815 | 0.206 |
| 12262.44662 | 0.206 |
| 12272.78796 | 0.206 |
| 12282.47948 | 0.206 |
| 12292.81339 | 0.206 |
| 12302.49796 | 0.206 |
| 12312.82444 | 0.206 |
| 12322.50203 | 0.206 |
| 12332.82106 | 0.207 |
| 12342.49167 | 0.207 |
| 12352.80325 | 0.207 |
| 12362.46686 | 0.207 |
| 12372.77097 | 0.207 |
| 12382.42757 | 0.207 |
| 12392.7242 | 0.207 |
| 12402.37378 | 0.207 |
| 12412.66292 | 0.207 |
| 12422.30547 | 0.207 |
| 12432.58711 | 0.207 |
| 12442.22262 | 0.208 |
| 12452.49673 | 0.208 |
| 12462.76697 | 0.208 |
| 12472.39178 | 0.208 |
| 12482.65448 | 0.208 |
| 12492.27222 | 0.208 |
| 12502.52738 | 0.207 |
| 12512.77863 | 0.207 |
| 12522.38563 | 0.207 |
| 12532.62932 | 0.207 |
| 12542.22922 | 0.207 |
| 12552.46533 | 0.207 |
| 12562.69753 | 0.207 |
| 12572.28665 | 0.207 |
| 12582.51125 | 0.207 |
| 12592.73192 | 0.207 |
| 12602.31024 | 0.207 |
| 12612.5233 | 0.207 |
| 12622.09447 | 0.207 |
| 12632.29991 | 0.207 |
| 12642.5014 | 0.207 |
| 12652.69895 | 0.207 |
| 12662.25557 | 0.207 |
| 12672.44547 | 0.207 |
| 12682.63142 | 0.207 |
| 12692.17715 | 0.207 |
| 12702.35544 | 0.207 |
| 12712.52975 | 0.207 |
| 12722.06458 | 0.208 |
| 12732.23121 | 0.208 |
| 12742.39387 | 0.208 |
| 12752.55256 | 0.208 |
| 12762.07271 | 0.208 |
| 12772.22369 | 0.208 |
| 12782.37068 | 0.208 |
| 12792.51369 | 0.209 |
| 12802.01913 | 0.209 |
| 12812.1544 | 0.209 |
| 12822.28568 | 0.209 |
| 12832.41295 | 0.209 |
| 12842.53622 | 0.209 |
| 12852.02315 | 0.209 |
| 12862.13866 | 0.209 |
| 12872.25016 | 0.209 |
| 12882.35764 | 0.209 |
| 12892.4611 | 0.209 |
| 12901.92944 | 0.209 |
| 12912.02511 | 0.209 |
| 12922.11675 | 0.209 |
| 12932.20436 | 0.209 |
| 12942.28794 | 0.209 |
| 12952.36747 | 0.21 |
| 12962.44297 | 0.211 |
| 12971.88508 | 0.21 |
| 12981.95274 | 0.21 |
| 12992.01635 | 0.21 |
| 13002.07591 | 0.21 |
| 13012.13141 | 0.21 |
| 13022.18286 | 0.21 |
| 13032.23024 | 0.21 |
| 13042.27356 | 0.211 |
| 13052.31281 | 0.211 |
| 13062.34799 | 0.211 |
| 13072.37909 | 0.211 |
| 13081.77955 | 0.211 |
| 13091.80275 | 0.211 |
| 13101.82186 | 0.211 |
| 13111.83689 | 0.211 |
| 13121.84783 | 0.211 |
| 13131.85468 | 0.212 |
| 13141.85743 | 0.212 |
| 13151.85608 | 0.212 |
| 13161.85063 | 0.212 |
| 13171.84107 | 0.211 |
| 13181.8274 | 0.211 |
| 13191.80963 | 0.211 |
| 13201.78774 | 0.211 |
| 13211.76172 | 0.211 |
| 13221.73159 | 0.211 |
| 13231.69734 | 0.211 |
| 13241.65895 | 0.211 |
| 13252.23865 | 0.211 |
| 13262.19174 | 0.211 |
| 13272.1407 | 0.211 |
| 13282.08552 | 0.211 |
| 13292.02619 | 0.211 |
| 13301.96272 | 0.211 |
| 13311.8951 | 0.211 |
| 13321.82333 | 0.211 |
| 13331.7474 | 0.211 |
| 13341.66731 | 0.211 |
| 13351.58306 | 0.212 |
| 13362.11398 | 0.212 |
| 13372.02114 | 0.212 |
| 13381.92413 | 0.212 |
| 13391.82294 | 0.212 |
| 13401.71758 | 0.212 |
| 13411.60803 | 0.212 |
| 13422.11206 | 0.212 |
| 13431.99388 | 0.212 |
| 13441.87151 | 0.212 |
| 13451.74495 | 0.212 |
| 13461.6142 | 0.212 |
| 13472.09567 | 0.213 |
| 13481.95625 | 0.213 |
| 13491.81263 | 0.213 |
| 13501.66479 | 0.213 |
| 13511.51275 | 0.213 |
| 13521.97158 | 0.213 |
| 13531.81084 | 0.213 |
| 13541.64588 | 0.213 |
| 13551.47669 | 0.212 |
| 13561.9173 | 0.212 |
| 13571.7394 | 0.212 |
| 13581.55725 | 0.212 |
| 13591.98409 | 0.212 |
| 13601.79321 | 0.212 |
| 13611.59808 | 0.212 |
| 13621.39871 | 0.213 |
| 13631.80722 | 0.213 |
| 13641.59909 | 0.213 |
| 13651.38669 | 0.213 |
| 13661.78136 | 0.213 |
| 13671.56018 | 0.214 |
| 13681.94551 | 0.214 |
| 13691.71553 | 0.214 |
| 13701.48128 | 0.214 |
| 13711.85271 | 0.214 |
| 13721.60964 | 0.213 |
| 13731.3623 | 0.213 |
| 13741.7198 | 0.213 |
| 13751.46361 | 0.213 |
| 13761.81172 | 0.213 |
| 13771.54668 | 0.213 |
| 13781.88538 | 0.214 |
| 13791.61148 | 0.214 |
| 13801.33328 | 0.214 |
| 13811.65798 | 0.214 |
| 13821.37089 | 0.214 |
| 13831.68615 | 0.214 |
| 13841.39017 | 0.214 |
| 13851.69596 | 0.215 |
| 13861.39108 | 0.214 |
| 13871.6874 | 0.215 |
| 13881.37359 | 0.214 |
| 13891.66043 | 0.214 |
| 13901.33769 | 0.214 |
| 13911.61502 | 0.214 |
| 13921.28334 | 0.215 |
| 13931.55116 | 0.215 |
| 13941.21051 | 0.216 |
| 13951.46881 | 0.216 |
| 13961.72219 | 0.215 |
| 13971.36795 | 0.215 |
| 13981.61179 | 0.216 |
| 13991.24855 | 0.216 |
| 14001.48283 | 0.216 |
| 14011.71217 | 0.216 |
| 14021.33529 | 0.216 |
| 14031.55505 | 0.216 |
| 14041.16914 | 0.217 |
| 14051.37931 | 0.217 |
| 14061.58453 | 0.217 |
| 14071.18493 | 0.217 |
| 14081.38053 | 0.217 |
| 14091.57118 | 0.217 |
| 14101.15785 | 0.218 |
| 14111.33886 | 0.218 |
| 14121.51491 | 0.218 |
| 14131.08782 | 0.218 |
| 14141.25421 | 0.218 |
| 14151.41561 | 0.218 |
| 14161.57204 | 0.217 |
| 14171.12647 | 0.217 |
| 14181.27321 | 0.217 |
| 14191.41496 | 0.218 |
| 14201.55171 | 0.218 |
| 14211.08762 | 0.218 |
| 14221.21466 | 0.218 |
| 14231.33669 | 0.218 |
| 14241.45371 | 0.218 |
| 14250.97103 | 0.219 |
| 14261.07831 | 0.218 |
| 14271.18057 | 0.219 |
| 14281.27781 | 0.219 |
| 14291.37001 | 0.219 |
| 14301.45718 | 0.219 |
| 14310.94639 | 0.219 |
| 14321.02379 | 0.219 |
| 14331.09614 | 0.219 |
| 14341.16344 | 0.219 |
| 14351.2257 | 0.219 |
| 14361.2829 | 0.219 |
| 14371.33504 | 0.22 |
| 14381.38213 | 0.22 |
| 14391.42415 | 0.22 |
| 14400.87083 | 0.22 |
| 14410.90301 | 0.22 |
| 14420.93011 | 0.22 |
| 14430.95214 | 0.22 |
| 14440.96908 | 0.22 |
| 14450.98094 | 0.22 |
| 14460.98771 | 0.221 |
| 14470.98939 | 0.221 |
| 14480.98597 | 0.221 |
| 14490.97745 | 0.221 |
| 14500.96383 | 0.221 |
| 14510.9451 | 0.221 |
| 14520.92127 | 0.221 |
| 14530.89232 | 0.221 |
| 14540.85825 | 0.221 |
| 14550.81906 | 0.221 |
| 14560.77475 | 0.222 |
| 14571.31048 | 0.222 |
| 14581.25561 | 0.223 |
| 14591.19561 | 0.223 |
| 14601.13046 | 0.223 |
| 14611.06018 | 0.223 |
| 14620.98475 | 0.223 |
| 14630.90417 | 0.224 |
| 14640.81844 | 0.225 |
| 14650.72755 | 0.226 |
| 14661.21393 | 0.227 |
| 14671.11242 | 0.227 |
| 14681.00574 | 0.228 |
| 14690.89389 | 0.228 |
| 14700.77687 | 0.229 |
| 14710.65467 | 0.229 |
| 14721.10787 | 0.229 |
| 14730.975 | 0.23 |
| 14740.83695 | 0.23 |
| 14750.6937 | 0.23 |
| 14761.12461 | 0.231 |
| 14770.97066 | 0.231 |
| 14780.81152 | 0.231 |
| 14790.64717 | 0.231 |
| 14801.05571 | 0.231 |
| 14810.88064 | 0.233 |
| 14820.70034 | 0.234 |
| 14831.09199 | 0.235 |
| 14840.90095 | 0.235 |
| 14850.70469 | 0.235 |
| 14861.07941 | 0.235 |
| 14870.87237 | 0.236 |
| 14880.6601 | 0.236 |
| 14891.01786 | 0.236 |
| 14900.7948 | 0.236 |
| 14910.56649 | 0.236 |
| 14920.90726 | 0.237 |
| 14930.66813 | 0.238 |
| 14940.99744 | 0.238 |
| 14950.74749 | 0.238 |
| 14960.49227 | 0.239 |
| 14970.80453 | 0.239 |
| 14980.53846 | 0.239 |
| 14990.83922 | 0.241 |
| 15000.56229 | 0.241 |
| 15010.85154 | 0.242 |
| 15020.56373 | 0.244 |
| 15030.84146 | 0.244 |
| 15040.54275 | 0.245 |
| 15050.80894 | 0.245 |
| 15060.49932 | 0.245 |
| 15070.75395 | 0.246 |
| 15080.43342 | 0.246 |
| 15090.67647 | 0.247 |
| 15100.91357 | 0.247 |
| 15110.57647 | 0.249 |
| 15120.80197 | 0.251 |
| 15130.45391 | 0.253 |
| 15140.6678 | 0.255 |
| 15150.87571 | 0.256 |
| 15160.51103 | 0.257 |
| 15170.70731 | 0.257 |
| 15180.33163 | 0.257 |
| 15190.51626 | 0.256 |
| 15200.69489 | 0.256 |
| 15210.30253 | 0.257 |
| 15220.4695 | 0.258 |
| 15230.63045 | 0.259 |
| 15240.78539 | 0.261 |
| 15250.37064 | 0.261 |
| 15260.51388 | 0.261 |
| 15270.65109 | 0.261 |
| 15280.78227 | 0.261 |
| 15290.34507 | 0.261 |
| 15300.46452 | 0.261 |
| 15310.57793 | 0.261 |
| 15320.6853 | 0.261 |
| 15330.22559 | 0.262 |
| 15340.32119 | 0.263 |
| 15350.41073 | 0.264 |
| 15360.49422 | 0.265 |
| 15370.57164 | 0.266 |
| 15380.64299 | 0.266 |
| 15390.70827 | 0.266 |
| 15400.20879 | 0.266 |
| 15410.26225 | 0.266 |
| 15420.30963 | 0.266 |
| 15430.35092 | 0.266 |
| 15440.38612 | 0.267 |
| 15450.41522 | 0.267 |
| 15460.43823 | 0.267 |
| 15470.45513 | 0.268 |
| 15480.46592 | 0.268 |
| 15490.4706 | 0.268 |
| 15500.46917 | 0.27 |
| 15510.46161 | 0.27 |
| 15520.44794 | 0.27 |
| 15530.42813 | 0.27 |
| 15540.4022 | 0.27 |
| 15550.37013 | 0.271 |
| 15560.33192 | 0.271 |
| 15570.28757 | 0.272 |
| 15580.23707 | 0.272 |
| 15590.18042 | 0.273 |
| 15600.11761 | 0.273 |
| 15610.04865 | 0.273 |
| 15620.52472 | 0.274 |
| 15630.44309 | 0.274 |
| 15640.35528 | 0.274 |
| 15650.2613 | 0.274 |
| 15660.16114 | 0.274 |
| 15670.0548 | 0.274 |
| 15680.4914 | 0.274 |
| 15690.37234 | 0.274 |
| 15700.24708 | 0.275 |
| 15710.11563 | 0.276 |
| 15719.97797 | 0.275 |
| 15730.38149 | 0.276 |
| 15740.23107 | 0.276 |
| 15750.07444 | 0.277 |
| 15759.91159 | 0.278 |
| 15770.2885 | 0.279 |
| 15780.11286 | 0.279 |
| 15789.93098 | 0.279 |
| 15800.2878 | 0.279 |
| 15810.09311 | 0.279 |
| 15819.89218 | 0.279 |
| 15830.22886 | 0.279 |
| 15840.01509 | 0.279 |
| 15850.33821 | 0.279 |
| 15860.11158 | 0.279 |
| 15869.87869 | 0.279 |
| 15880.18161 | 0.279 |
| 15889.93584 | 0.28 |
| 15900.22516 | 0.28 |
| 15909.96648 | 0.28 |
| 15920.24218 | 0.28 |
| 15929.97059 | 0.28 |
| 15940.23264 | 0.281 |
| 15949.94812 | 0.281 |
| 15960.19652 | 0.281 |
| 15969.89905 | 0.281 |
| 15980.13377 | 0.282 |
| 15989.82334 | 0.283 |
| 16000.04436 | 0.283 |